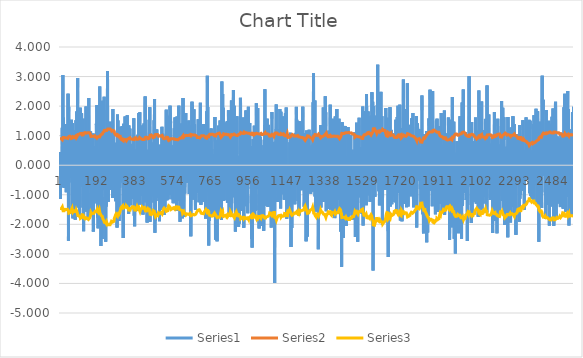
| Category | Series 0 | Series 1 | Series 2 |
|---|---|---|---|
| 0 | -0.597 | 0.893 | -1.465 |
| 1 | 0.451 | 0.897 | -1.471 |
| 2 | -1.136 | 0.885 | -1.452 |
| 3 | -0.21 | 0.897 | -1.47 |
| 4 | -0.419 | 0.896 | -1.469 |
| 5 | 0.134 | 0.898 | -1.472 |
| 6 | -0.705 | 0.895 | -1.468 |
| 7 | 0.045 | 0.893 | -1.465 |
| 8 | -0.238 | 0.889 | -1.459 |
| 9 | 0.111 | 0.889 | -1.458 |
| 10 | -0.522 | 0.889 | -1.458 |
| 11 | 1.27 | 0.861 | -1.412 |
| 12 | -0.726 | 0.874 | -1.433 |
| 13 | 1.199 | 0.858 | -1.408 |
| 14 | 3.053 | 0.871 | -1.428 |
| 15 | 0.396 | 0.938 | -1.538 |
| 16 | -0.129 | 0.933 | -1.53 |
| 17 | 1.608 | 0.933 | -1.53 |
| 18 | 0.61 | 0.951 | -1.559 |
| 19 | -0.571 | 0.953 | -1.562 |
| 20 | -0.77 | 0.948 | -1.554 |
| 21 | -0.479 | 0.937 | -1.537 |
| 22 | 0.335 | 0.94 | -1.541 |
| 23 | 0.645 | 0.933 | -1.531 |
| 24 | -0.552 | 0.919 | -1.507 |
| 25 | -0.327 | 0.909 | -1.491 |
| 26 | 1.396 | 0.91 | -1.493 |
| 27 | -0.517 | 0.924 | -1.515 |
| 28 | -0.21 | 0.926 | -1.519 |
| 29 | 0.974 | 0.919 | -1.508 |
| 30 | -0.622 | 0.92 | -1.509 |
| 31 | -0.914 | 0.914 | -1.499 |
| 32 | 1.047 | 0.915 | -1.5 |
| 33 | 0.181 | 0.922 | -1.511 |
| 34 | 0.714 | 0.916 | -1.502 |
| 35 | 0.732 | 0.919 | -1.506 |
| 36 | 0.604 | 0.909 | -1.491 |
| 37 | -0.084 | 0.909 | -1.49 |
| 38 | 0.4 | 0.907 | -1.487 |
| 39 | -0.114 | 0.907 | -1.488 |
| 40 | 2.415 | 0.907 | -1.488 |
| 41 | 0.81 | 0.911 | -1.494 |
| 42 | -2.558 | 0.91 | -1.492 |
| 43 | 1.98 | 0.964 | -1.581 |
| 44 | 0.591 | 0.989 | -1.623 |
| 45 | -0.587 | 0.991 | -1.625 |
| 46 | -0.265 | 0.992 | -1.626 |
| 47 | -0.119 | 0.991 | -1.625 |
| 48 | 0.404 | 0.989 | -1.623 |
| 49 | -0.02 | 0.985 | -1.615 |
| 50 | -0.259 | 0.979 | -1.605 |
| 51 | -0.334 | 0.975 | -1.599 |
| 52 | 0.205 | 0.967 | -1.586 |
| 53 | -0.427 | 0.966 | -1.584 |
| 54 | 0.658 | 0.954 | -1.564 |
| 55 | 0.665 | 0.955 | -1.566 |
| 56 | 0.812 | 0.923 | -1.514 |
| 57 | 1.536 | 0.908 | -1.489 |
| 58 | 0.775 | 0.915 | -1.501 |
| 59 | 0.772 | 0.916 | -1.503 |
| 60 | -1.595 | 0.886 | -1.453 |
| 61 | -0.027 | 0.913 | -1.497 |
| 62 | 1.423 | 0.913 | -1.497 |
| 63 | -1.219 | 0.925 | -1.518 |
| 64 | -1.798 | 0.933 | -1.531 |
| 65 | 0.377 | 0.964 | -1.58 |
| 66 | 0.364 | 0.956 | -1.568 |
| 67 | -0.644 | 0.952 | -1.561 |
| 68 | 0.291 | 0.956 | -1.568 |
| 69 | 0.253 | 0.943 | -1.546 |
| 70 | 0.849 | 0.942 | -1.544 |
| 71 | 0.849 | 0.942 | -1.545 |
| 72 | 0.455 | 0.945 | -1.55 |
| 73 | 0.285 | 0.939 | -1.54 |
| 74 | 0.08 | 0.939 | -1.539 |
| 75 | -1.136 | 0.937 | -1.537 |
| 76 | -1.844 | 0.952 | -1.561 |
| 77 | 0.257 | 0.981 | -1.609 |
| 78 | 1.19 | 0.972 | -1.594 |
| 79 | -0.852 | 0.973 | -1.596 |
| 80 | 1.524 | 0.974 | -1.597 |
| 81 | -1.434 | 0.921 | -1.511 |
| 82 | -0.239 | 0.941 | -1.544 |
| 83 | -1.377 | 0.942 | -1.545 |
| 84 | 1.815 | 0.942 | -1.544 |
| 85 | -0.211 | 0.963 | -1.58 |
| 86 | 1.783 | 0.96 | -1.575 |
| 87 | 1.184 | 0.976 | -1.6 |
| 88 | 2.951 | 0.981 | -1.609 |
| 89 | -0.271 | 1.039 | -1.704 |
| 90 | -0.774 | 1.039 | -1.704 |
| 91 | 0.122 | 1.042 | -1.709 |
| 92 | -1.097 | 1.04 | -1.705 |
| 93 | 1.173 | 1.041 | -1.707 |
| 94 | -0.289 | 1.045 | -1.713 |
| 95 | 0.059 | 1.045 | -1.714 |
| 96 | -0.729 | 1.041 | -1.707 |
| 97 | 1.056 | 1.042 | -1.709 |
| 98 | -1.722 | 1.039 | -1.704 |
| 99 | 0.331 | 1.06 | -1.738 |
| 100 | -1.43 | 1.06 | -1.738 |
| 101 | 1.947 | 1.076 | -1.764 |
| 102 | -0.699 | 1.096 | -1.798 |
| 103 | -0.503 | 1.1 | -1.803 |
| 104 | -0.391 | 1.102 | -1.807 |
| 105 | 0.433 | 1.103 | -1.809 |
| 106 | 1.349 | 1.104 | -1.81 |
| 107 | 1.07 | 1.077 | -1.766 |
| 108 | 1.76 | 1.08 | -1.771 |
| 109 | 0.237 | 1.047 | -1.716 |
| 110 | 0.953 | 1.022 | -1.676 |
| 111 | 0.585 | 1.025 | -1.681 |
| 112 | -0.728 | 1.022 | -1.677 |
| 113 | 0.069 | 1.027 | -1.684 |
| 114 | 0.091 | 1.027 | -1.684 |
| 115 | -0.082 | 1.026 | -1.683 |
| 116 | 1.569 | 1.026 | -1.683 |
| 117 | 1.038 | 1.039 | -1.705 |
| 118 | -2.237 | 1.043 | -1.71 |
| 119 | 0.933 | 1.085 | -1.78 |
| 120 | -1.104 | 1.087 | -1.782 |
| 121 | -0.922 | 1.097 | -1.798 |
| 122 | -0.047 | 1.103 | -1.808 |
| 123 | -1.277 | 1.1 | -1.804 |
| 124 | -1.127 | 1.099 | -1.802 |
| 125 | 0.665 | 1.105 | -1.813 |
| 126 | -0.101 | 1.104 | -1.811 |
| 127 | 0.44 | 1.085 | -1.78 |
| 128 | -1.568 | 1.086 | -1.781 |
| 129 | 0.601 | 1.092 | -1.79 |
| 130 | 1.984 | 1.082 | -1.775 |
| 131 | -1.056 | 1.082 | -1.775 |
| 132 | -0.138 | 1.091 | -1.79 |
| 133 | -0.617 | 1.091 | -1.79 |
| 134 | 0.974 | 1.091 | -1.789 |
| 135 | 0.381 | 1.096 | -1.798 |
| 136 | -0.602 | 1.097 | -1.798 |
| 137 | 0.552 | 1.096 | -1.797 |
| 138 | -0.956 | 1.093 | -1.793 |
| 139 | -0.367 | 1.1 | -1.804 |
| 140 | 0.839 | 1.101 | -1.805 |
| 141 | -1.842 | 1.105 | -1.812 |
| 142 | -0.941 | 1.12 | -1.837 |
| 143 | -0.284 | 1.102 | -1.807 |
| 144 | 2.278 | 1.102 | -1.808 |
| 145 | 0.407 | 1.127 | -1.849 |
| 146 | -0.18 | 1.122 | -1.84 |
| 147 | -0.326 | 1.108 | -1.818 |
| 148 | -0.035 | 1.094 | -1.793 |
| 149 | 0.41 | 1.093 | -1.792 |
| 150 | -0.357 | 1.078 | -1.768 |
| 151 | 0.027 | 1.058 | -1.736 |
| 152 | -0.225 | 1.058 | -1.735 |
| 153 | 1.145 | 1.037 | -1.7 |
| 154 | -0.587 | 1.036 | -1.699 |
| 155 | -0.283 | 0.973 | -1.596 |
| 156 | 0.76 | 0.973 | -1.596 |
| 157 | -1.681 | 0.973 | -1.596 |
| 158 | -0.484 | 0.995 | -1.632 |
| 159 | -0.49 | 0.988 | -1.62 |
| 160 | -0.611 | 0.979 | -1.605 |
| 161 | 0.111 | 0.981 | -1.608 |
| 162 | -1.557 | 0.981 | -1.609 |
| 163 | -1.254 | 0.995 | -1.632 |
| 164 | -0.974 | 0.997 | -1.635 |
| 165 | 0.595 | 0.982 | -1.61 |
| 166 | 1.07 | 0.984 | -1.614 |
| 167 | -2.244 | 0.978 | -1.605 |
| 168 | -1.311 | 0.985 | -1.615 |
| 169 | -0.008 | 0.993 | -1.629 |
| 170 | -0.696 | 0.992 | -1.627 |
| 171 | -1.287 | 0.994 | -1.631 |
| 172 | -1.211 | 1.003 | -1.645 |
| 173 | -0.786 | 0.995 | -1.632 |
| 174 | -0.628 | 0.986 | -1.617 |
| 175 | -0.438 | 0.957 | -1.569 |
| 176 | -1.212 | 0.956 | -1.567 |
| 177 | 0.642 | 0.951 | -1.56 |
| 178 | 0.427 | 0.952 | -1.562 |
| 179 | -0.964 | 0.954 | -1.565 |
| 180 | -0.169 | 0.957 | -1.57 |
| 181 | 0.054 | 0.956 | -1.569 |
| 182 | 1.401 | 0.957 | -1.569 |
| 183 | 1.029 | 0.952 | -1.562 |
| 184 | -0.371 | 0.952 | -1.561 |
| 185 | 2.033 | 0.92 | -1.508 |
| 186 | -1.047 | 0.951 | -1.559 |
| 187 | 0.53 | 0.95 | -1.558 |
| 188 | -0.055 | 0.95 | -1.558 |
| 189 | -1.765 | 0.95 | -1.558 |
| 190 | -0.616 | 0.961 | -1.575 |
| 191 | -2.134 | 0.955 | -1.566 |
| 192 | -0.524 | 0.978 | -1.604 |
| 193 | -0.333 | 0.979 | -1.605 |
| 194 | 0.197 | 0.975 | -1.599 |
| 195 | 0.435 | 0.962 | -1.578 |
| 196 | 0.133 | 0.96 | -1.575 |
| 197 | -0.797 | 0.921 | -1.51 |
| 198 | 0.426 | 0.918 | -1.506 |
| 199 | 2.661 | 0.922 | -1.512 |
| 200 | 0.821 | 0.988 | -1.62 |
| 201 | -0.054 | 0.985 | -1.615 |
| 202 | 1.041 | 0.982 | -1.611 |
| 203 | 0.461 | 0.993 | -1.629 |
| 204 | -0.096 | 0.992 | -1.627 |
| 205 | -2.734 | 0.987 | -1.619 |
| 206 | 0.569 | 1.036 | -1.7 |
| 207 | 2.045 | 1.033 | -1.694 |
| 208 | -0.923 | 1.049 | -1.72 |
| 209 | 0.058 | 1.049 | -1.72 |
| 210 | 1.26 | 1.049 | -1.72 |
| 211 | -2.494 | 1.02 | -1.673 |
| 212 | -1.073 | 1.057 | -1.733 |
| 213 | 0.762 | 1.062 | -1.742 |
| 214 | 2.182 | 1.069 | -1.753 |
| 215 | 1.005 | 1.108 | -1.818 |
| 216 | -0.023 | 1.116 | -1.829 |
| 217 | -0.83 | 1.115 | -1.829 |
| 218 | 1.402 | 1.118 | -1.834 |
| 219 | 0.952 | 1.135 | -1.861 |
| 220 | 0.998 | 1.132 | -1.856 |
| 221 | 2.317 | 1.139 | -1.868 |
| 222 | 1.319 | 1.178 | -1.931 |
| 223 | 0.836 | 1.186 | -1.945 |
| 224 | 0.944 | 1.174 | -1.925 |
| 225 | 1.205 | 1.179 | -1.933 |
| 226 | -0.096 | 1.186 | -1.946 |
| 227 | 0.425 | 1.184 | -1.942 |
| 228 | -0.563 | 1.185 | -1.943 |
| 229 | -2.59 | 1.171 | -1.92 |
| 230 | -0.159 | 1.205 | -1.975 |
| 231 | -1.397 | 1.198 | -1.965 |
| 232 | 0.579 | 1.209 | -1.983 |
| 233 | -0.983 | 1.204 | -1.974 |
| 234 | -0.552 | 1.177 | -1.931 |
| 235 | 0.965 | 1.168 | -1.916 |
| 236 | 1.873 | 1.174 | -1.925 |
| 237 | 0.317 | 1.191 | -1.954 |
| 238 | 3.184 | 1.18 | -1.934 |
| 239 | 0.467 | 1.227 | -2.013 |
| 240 | 1.442 | 1.222 | -2.004 |
| 241 | -0.115 | 1.227 | -2.013 |
| 242 | -1.233 | 1.225 | -2.01 |
| 243 | 0.581 | 1.226 | -2.01 |
| 244 | -0.239 | 1.225 | -2.01 |
| 245 | 1.105 | 1.226 | -2.011 |
| 246 | 1.436 | 1.222 | -2.005 |
| 247 | 0.508 | 1.23 | -2.017 |
| 248 | 1.421 | 1.23 | -2.017 |
| 249 | 0.379 | 1.23 | -2.018 |
| 250 | 0.98 | 1.227 | -2.012 |
| 251 | -0.023 | 1.227 | -2.013 |
| 252 | -0.828 | 1.208 | -1.981 |
| 253 | 1.473 | 1.205 | -1.976 |
| 254 | 0.045 | 1.214 | -1.991 |
| 255 | -0.48 | 1.213 | -1.99 |
| 256 | -0.483 | 1.19 | -1.952 |
| 257 | 1.377 | 1.189 | -1.95 |
| 258 | 1.028 | 1.157 | -1.897 |
| 259 | -0.828 | 1.154 | -1.893 |
| 260 | -0.353 | 1.161 | -1.903 |
| 261 | -0.267 | 1.164 | -1.909 |
| 262 | -0.096 | 1.166 | -1.913 |
| 263 | -1.109 | 1.167 | -1.914 |
| 264 | -0.554 | 1.173 | -1.923 |
| 265 | 1.903 | 1.178 | -1.931 |
| 266 | 0.697 | 1.158 | -1.899 |
| 267 | -0.135 | 1.157 | -1.898 |
| 268 | 0.239 | 1.158 | -1.899 |
| 269 | 1.159 | 1.154 | -1.893 |
| 270 | -0.053 | 1.159 | -1.9 |
| 271 | -0.529 | 1.159 | -1.9 |
| 272 | -0.928 | 1.1 | -1.804 |
| 273 | -0.229 | 1.11 | -1.821 |
| 274 | 0.148 | 1.091 | -1.789 |
| 275 | -1.08 | 1.081 | -1.773 |
| 276 | 0.533 | 1.094 | -1.794 |
| 277 | 0.209 | 1.087 | -1.783 |
| 278 | 0.05 | 1.031 | -1.691 |
| 279 | -1.22 | 1.017 | -1.668 |
| 280 | 0.472 | 1.033 | -1.694 |
| 281 | 0.763 | 1.006 | -1.65 |
| 282 | 0.034 | 1.004 | -1.647 |
| 283 | -0.666 | 1.004 | -1.646 |
| 284 | -1.138 | 1.001 | -1.642 |
| 285 | -0.571 | 1.006 | -1.65 |
| 286 | -2.11 | 1.007 | -1.651 |
| 287 | -0.48 | 1.041 | -1.708 |
| 288 | 1.716 | 1.009 | -1.655 |
| 289 | -0.065 | 1.017 | -1.668 |
| 290 | 1.516 | 1.014 | -1.662 |
| 291 | -0.362 | 1.023 | -1.678 |
| 292 | -0.235 | 1.016 | -1.666 |
| 293 | -0.363 | 1.016 | -1.667 |
| 294 | 0.826 | 1.017 | -1.668 |
| 295 | 0.535 | 1.018 | -1.669 |
| 296 | -1.889 | 0.962 | -1.577 |
| 297 | 0.321 | 0.993 | -1.629 |
| 298 | 0.355 | 0.975 | -1.599 |
| 299 | -0.766 | 0.974 | -1.598 |
| 300 | -0.761 | 0.971 | -1.592 |
| 301 | 0.89 | 0.973 | -1.596 |
| 302 | -0.579 | 0.972 | -1.595 |
| 303 | 0.084 | 0.952 | -1.561 |
| 304 | 1.3 | 0.952 | -1.561 |
| 305 | -0.255 | 0.884 | -1.45 |
| 306 | 0.682 | 0.884 | -1.449 |
| 307 | 0.068 | 0.87 | -1.427 |
| 308 | -0.509 | 0.87 | -1.427 |
| 309 | 0.034 | 0.858 | -1.407 |
| 310 | -0.236 | 0.855 | -1.403 |
| 311 | -0.584 | 0.855 | -1.403 |
| 312 | 1.323 | 0.849 | -1.392 |
| 313 | 0.714 | 0.846 | -1.388 |
| 314 | -0.475 | 0.848 | -1.391 |
| 315 | 0.531 | 0.833 | -1.366 |
| 316 | 0.514 | 0.834 | -1.368 |
| 317 | -2.463 | 0.828 | -1.357 |
| 318 | -0.816 | 0.882 | -1.446 |
| 319 | 1.402 | 0.882 | -1.446 |
| 320 | 0.449 | 0.88 | -1.443 |
| 321 | 0.14 | 0.882 | -1.446 |
| 322 | -0.707 | 0.88 | -1.443 |
| 323 | 0.068 | 0.882 | -1.447 |
| 324 | -0.059 | 0.865 | -1.418 |
| 325 | 0.494 | 0.855 | -1.401 |
| 326 | 1.646 | 0.852 | -1.397 |
| 327 | 0.441 | 0.876 | -1.436 |
| 328 | 0.464 | 0.877 | -1.438 |
| 329 | 0.118 | 0.878 | -1.44 |
| 330 | 0.032 | 0.867 | -1.422 |
| 331 | -0.381 | 0.864 | -1.417 |
| 332 | 0.371 | 0.833 | -1.367 |
| 333 | -1.379 | 0.83 | -1.362 |
| 334 | -0.591 | 0.847 | -1.39 |
| 335 | 0.87 | 0.85 | -1.393 |
| 336 | 1.227 | 0.844 | -1.384 |
| 337 | 1.688 | 0.858 | -1.408 |
| 338 | 1.072 | 0.881 | -1.445 |
| 339 | -1.036 | 0.882 | -1.447 |
| 340 | 0.571 | 0.892 | -1.463 |
| 341 | -0.887 | 0.894 | -1.466 |
| 342 | -1.06 | 0.891 | -1.461 |
| 343 | 0.709 | 0.899 | -1.474 |
| 344 | -1.643 | 0.903 | -1.48 |
| 345 | 1.345 | 0.926 | -1.518 |
| 346 | 0.541 | 0.927 | -1.521 |
| 347 | -0.889 | 0.928 | -1.522 |
| 348 | 0.364 | 0.931 | -1.526 |
| 349 | 0.201 | 0.931 | -1.528 |
| 350 | 1.239 | 0.928 | -1.521 |
| 351 | -0.626 | 0.928 | -1.521 |
| 352 | 0.596 | 0.928 | -1.522 |
| 353 | -0.463 | 0.889 | -1.459 |
| 354 | -1.357 | 0.889 | -1.458 |
| 355 | -1.375 | 0.884 | -1.45 |
| 356 | -0.174 | 0.902 | -1.479 |
| 357 | -0.697 | 0.883 | -1.449 |
| 358 | -0.088 | 0.886 | -1.454 |
| 359 | -0.393 | 0.886 | -1.453 |
| 360 | 0.261 | 0.886 | -1.453 |
| 361 | 0.72 | 0.881 | -1.445 |
| 362 | -0.799 | 0.883 | -1.448 |
| 363 | -0.677 | 0.857 | -1.405 |
| 364 | -1.145 | 0.86 | -1.411 |
| 365 | 0.443 | 0.871 | -1.428 |
| 366 | 0.066 | 0.867 | -1.422 |
| 367 | 0.726 | 0.862 | -1.414 |
| 368 | -0.301 | 0.86 | -1.41 |
| 369 | 0.464 | 0.857 | -1.406 |
| 370 | 1.59 | 0.859 | -1.409 |
| 371 | -0.673 | 0.866 | -1.421 |
| 372 | -1.707 | 0.87 | -1.427 |
| 373 | -0.136 | 0.892 | -1.463 |
| 374 | -2.062 | 0.892 | -1.463 |
| 375 | -0.554 | 0.925 | -1.517 |
| 376 | -1.542 | 0.927 | -1.52 |
| 377 | 0.469 | 0.945 | -1.55 |
| 378 | -0.231 | 0.945 | -1.55 |
| 379 | -0.373 | 0.93 | -1.524 |
| 380 | -0.644 | 0.925 | -1.517 |
| 381 | -0.296 | 0.926 | -1.519 |
| 382 | 0.533 | 0.923 | -1.514 |
| 383 | -0.192 | 0.924 | -1.515 |
| 384 | -0.517 | 0.875 | -1.436 |
| 385 | 0.06 | 0.872 | -1.43 |
| 386 | 0.843 | 0.853 | -1.399 |
| 387 | -1.535 | 0.858 | -1.407 |
| 388 | -0.374 | 0.876 | -1.437 |
| 389 | 0.437 | 0.873 | -1.432 |
| 390 | -0.145 | 0.876 | -1.436 |
| 391 | 1.031 | 0.876 | -1.436 |
| 392 | -0.297 | 0.884 | -1.449 |
| 393 | -1.046 | 0.857 | -1.406 |
| 394 | 0.567 | 0.862 | -1.413 |
| 395 | 1.768 | 0.863 | -1.415 |
| 396 | 0.662 | 0.894 | -1.466 |
| 397 | 1.703 | 0.899 | -1.474 |
| 398 | -1.331 | 0.925 | -1.517 |
| 399 | 0.978 | 0.936 | -1.535 |
| 400 | 1.789 | 0.931 | -1.528 |
| 401 | -0.49 | 0.956 | -1.569 |
| 402 | -0.179 | 0.951 | -1.56 |
| 403 | 0.567 | 0.938 | -1.539 |
| 404 | -0.173 | 0.916 | -1.502 |
| 405 | -0.082 | 0.904 | -1.483 |
| 406 | 1.32 | 0.897 | -1.471 |
| 407 | 0.426 | 0.91 | -1.492 |
| 408 | -0.507 | 0.906 | -1.486 |
| 409 | -0.148 | 0.899 | -1.475 |
| 410 | -0.656 | 0.894 | -1.467 |
| 411 | 0.21 | 0.876 | -1.436 |
| 412 | -0.163 | 0.859 | -1.409 |
| 413 | -0.841 | 0.856 | -1.403 |
| 414 | -1.041 | 0.855 | -1.402 |
| 415 | 0.286 | 0.861 | -1.413 |
| 416 | -1.669 | 0.862 | -1.413 |
| 417 | 1.359 | 0.867 | -1.422 |
| 418 | -0.469 | 0.884 | -1.45 |
| 419 | -0.063 | 0.881 | -1.444 |
| 420 | 0.12 | 0.88 | -1.443 |
| 421 | 1.408 | 0.866 | -1.421 |
| 422 | 0.537 | 0.871 | -1.428 |
| 423 | -0.359 | 0.874 | -1.433 |
| 424 | 1.243 | 0.871 | -1.428 |
| 425 | 0.666 | 0.885 | -1.451 |
| 426 | -1.251 | 0.888 | -1.456 |
| 427 | 2.328 | 0.9 | -1.476 |
| 428 | -0.136 | 0.942 | -1.544 |
| 429 | 1.095 | 0.936 | -1.536 |
| 430 | -0.612 | 0.942 | -1.545 |
| 431 | -0.636 | 0.934 | -1.531 |
| 432 | -0.489 | 0.936 | -1.535 |
| 433 | -1.103 | 0.938 | -1.539 |
| 434 | 0.485 | 0.944 | -1.548 |
| 435 | -0.176 | 0.945 | -1.55 |
| 436 | -0.072 | 0.944 | -1.548 |
| 437 | -1.94 | 0.922 | -1.513 |
| 438 | 0.482 | 0.949 | -1.556 |
| 439 | 0.523 | 0.928 | -1.522 |
| 440 | -0.436 | 0.93 | -1.526 |
| 441 | -0.478 | 0.896 | -1.469 |
| 442 | -0.544 | 0.895 | -1.468 |
| 443 | -0.84 | 0.877 | -1.438 |
| 444 | -1.205 | 0.882 | -1.446 |
| 445 | -1.113 | 0.894 | -1.466 |
| 446 | 0.882 | 0.903 | -1.481 |
| 447 | 1.542 | 0.906 | -1.486 |
| 448 | -0.723 | 0.925 | -1.517 |
| 449 | -1.879 | 0.927 | -1.521 |
| 450 | 1.96 | 0.956 | -1.568 |
| 451 | -1.916 | 0.984 | -1.614 |
| 452 | 0.438 | 1.013 | -1.661 |
| 453 | 1.067 | 1.009 | -1.654 |
| 454 | 1.007 | 0.999 | -1.638 |
| 455 | -1.484 | 1.005 | -1.647 |
| 456 | 0.675 | 1.021 | -1.674 |
| 457 | 0.777 | 1.024 | -1.679 |
| 458 | -1.057 | 1.021 | -1.674 |
| 459 | -0.28 | 1.029 | -1.687 |
| 460 | 0.194 | 1.021 | -1.674 |
| 461 | 0.734 | 1.019 | -1.671 |
| 462 | -0.627 | 0.999 | -1.639 |
| 463 | 0.713 | 0.999 | -1.638 |
| 464 | 0.424 | 0.98 | -1.608 |
| 465 | -0.374 | 0.968 | -1.587 |
| 466 | 0.222 | 0.961 | -1.577 |
| 467 | 0.051 | 0.935 | -1.533 |
| 468 | -0.524 | 0.933 | -1.531 |
| 469 | 0.213 | 0.935 | -1.534 |
| 470 | 0.526 | 0.933 | -1.53 |
| 471 | -1.259 | 0.935 | -1.534 |
| 472 | 1.519 | 0.947 | -1.554 |
| 473 | 0.561 | 0.952 | -1.561 |
| 474 | 2.241 | 0.953 | -1.563 |
| 475 | -0.775 | 0.992 | -1.627 |
| 476 | -2.284 | 0.996 | -1.634 |
| 477 | -0.716 | 1.032 | -1.693 |
| 478 | -1.879 | 1.035 | -1.697 |
| 479 | 0.457 | 1.059 | -1.737 |
| 480 | 0.397 | 1.057 | -1.733 |
| 481 | 0.347 | 1.051 | -1.723 |
| 482 | -1.206 | 1.051 | -1.724 |
| 483 | 0.252 | 1.042 | -1.708 |
| 484 | 0.046 | 1.028 | -1.686 |
| 485 | 1.209 | 1.026 | -1.683 |
| 486 | 0.962 | 1.038 | -1.702 |
| 487 | -0.975 | 1.045 | -1.713 |
| 488 | 0.996 | 1.036 | -1.699 |
| 489 | -0.035 | 1.042 | -1.708 |
| 490 | -0.415 | 1.041 | -1.707 |
| 491 | -0.395 | 1.03 | -1.689 |
| 492 | -1.101 | 1.027 | -1.684 |
| 493 | -0.34 | 1.024 | -1.68 |
| 494 | -0.986 | 0.98 | -1.607 |
| 495 | -1.105 | 0.986 | -1.617 |
| 496 | 0.167 | 0.981 | -1.609 |
| 497 | 0.307 | 0.98 | -1.608 |
| 498 | -0.277 | 0.98 | -1.607 |
| 499 | -1.895 | 0.979 | -1.606 |
| 500 | 0.694 | 0.996 | -1.633 |
| 501 | -1.154 | 0.998 | -1.637 |
| 502 | -0.578 | 1.006 | -1.65 |
| 503 | 0.673 | 1.008 | -1.652 |
| 504 | -0.162 | 0.987 | -1.619 |
| 505 | -0.324 | 0.985 | -1.615 |
| 506 | -0.143 | 0.982 | -1.61 |
| 507 | 0.473 | 0.981 | -1.609 |
| 508 | -1.497 | 0.983 | -1.612 |
| 509 | -1.205 | 0.996 | -1.633 |
| 510 | -1.237 | 1.001 | -1.642 |
| 511 | 1.298 | 1.001 | -1.642 |
| 512 | 0.516 | 1.009 | -1.655 |
| 513 | 0.212 | 1.005 | -1.648 |
| 514 | -0.236 | 0.984 | -1.614 |
| 515 | 1.064 | 0.982 | -1.61 |
| 516 | 0.443 | 0.967 | -1.586 |
| 517 | -0.054 | 0.936 | -1.535 |
| 518 | -0.044 | 0.908 | -1.489 |
| 519 | -0.708 | 0.906 | -1.485 |
| 520 | -1.442 | 0.897 | -1.472 |
| 521 | 0.031 | 0.901 | -1.478 |
| 522 | -0.471 | 0.886 | -1.453 |
| 523 | -1.672 | 0.881 | -1.445 |
| 524 | -0.508 | 0.893 | -1.465 |
| 525 | 0.708 | 0.888 | -1.456 |
| 526 | -1.431 | 0.894 | -1.466 |
| 527 | 0.598 | 0.907 | -1.487 |
| 528 | 0.908 | 0.905 | -1.484 |
| 529 | 0.631 | 0.913 | -1.497 |
| 530 | 0.886 | 0.912 | -1.495 |
| 531 | 0.111 | 0.918 | -1.505 |
| 532 | -0.204 | 0.918 | -1.505 |
| 533 | 1.877 | 0.917 | -1.504 |
| 534 | -0.959 | 0.95 | -1.558 |
| 535 | -0.022 | 0.954 | -1.565 |
| 536 | -1.182 | 0.953 | -1.564 |
| 537 | -0.103 | 0.958 | -1.572 |
| 538 | 1.285 | 0.948 | -1.556 |
| 539 | 0.205 | 0.943 | -1.546 |
| 540 | -0.023 | 0.94 | -1.541 |
| 541 | 0.213 | 0.891 | -1.461 |
| 542 | -1.155 | 0.889 | -1.458 |
| 543 | 0.394 | 0.858 | -1.407 |
| 544 | 0.748 | 0.858 | -1.407 |
| 545 | 0.166 | 0.836 | -1.371 |
| 546 | 0.904 | 0.834 | -1.368 |
| 547 | 0.159 | 0.841 | -1.379 |
| 548 | -0.069 | 0.84 | -1.377 |
| 549 | 0.634 | 0.828 | -1.358 |
| 550 | 1.673 | 0.832 | -1.364 |
| 551 | -1.008 | 0.859 | -1.409 |
| 552 | 2.011 | 0.852 | -1.398 |
| 553 | 0.708 | 0.881 | -1.446 |
| 554 | 1.749 | 0.879 | -1.442 |
| 555 | 1.419 | 0.897 | -1.472 |
| 556 | 0.495 | 0.915 | -1.5 |
| 557 | -0.434 | 0.915 | -1.501 |
| 558 | -0.238 | 0.916 | -1.502 |
| 559 | 0.674 | 0.906 | -1.485 |
| 560 | -0.187 | 0.908 | -1.489 |
| 561 | -1.155 | 0.899 | -1.475 |
| 562 | -0.085 | 0.9 | -1.477 |
| 563 | -0.128 | 0.9 | -1.477 |
| 564 | -1.138 | 0.9 | -1.476 |
| 565 | -1.082 | 0.911 | -1.494 |
| 566 | -0.635 | 0.89 | -1.459 |
| 567 | 0.573 | 0.89 | -1.459 |
| 568 | -1.283 | 0.88 | -1.443 |
| 569 | -0.136 | 0.892 | -1.463 |
| 570 | -0.722 | 0.889 | -1.457 |
| 571 | 0.289 | 0.893 | -1.465 |
| 572 | 0.362 | 0.893 | -1.464 |
| 573 | 1.247 | 0.893 | -1.465 |
| 574 | 0.251 | 0.904 | -1.483 |
| 575 | 0.601 | 0.884 | -1.45 |
| 576 | -0.702 | 0.872 | -1.43 |
| 577 | 1.612 | 0.862 | -1.413 |
| 578 | 0.056 | 0.869 | -1.425 |
| 579 | 0.067 | 0.868 | -1.423 |
| 580 | -0.291 | 0.868 | -1.423 |
| 581 | -0.197 | 0.868 | -1.423 |
| 582 | 0.14 | 0.86 | -1.411 |
| 583 | 0.605 | 0.859 | -1.409 |
| 584 | -0.869 | 0.861 | -1.413 |
| 585 | -1.548 | 0.869 | -1.425 |
| 586 | -0.524 | 0.887 | -1.454 |
| 587 | 1.652 | 0.87 | -1.427 |
| 588 | -0.182 | 0.891 | -1.462 |
| 589 | 0.221 | 0.889 | -1.458 |
| 590 | -0.297 | 0.861 | -1.412 |
| 591 | 0.965 | 0.859 | -1.409 |
| 592 | -0.749 | 0.862 | -1.414 |
| 593 | -1.199 | 0.847 | -1.389 |
| 594 | 1.028 | 0.861 | -1.413 |
| 595 | 0.854 | 0.863 | -1.415 |
| 596 | 2.015 | 0.866 | -1.42 |
| 597 | -0.79 | 0.892 | -1.462 |
| 598 | -1.192 | 0.899 | -1.474 |
| 599 | 1.406 | 0.913 | -1.497 |
| 600 | 0.939 | 0.9 | -1.477 |
| 601 | -0.89 | 0.896 | -1.47 |
| 602 | -1.912 | 0.905 | -1.484 |
| 603 | -0.146 | 0.925 | -1.518 |
| 604 | -0.952 | 0.925 | -1.518 |
| 605 | -0.305 | 0.923 | -1.513 |
| 606 | 0.881 | 0.924 | -1.515 |
| 607 | 0.151 | 0.929 | -1.524 |
| 608 | -0.816 | 0.929 | -1.524 |
| 609 | -0.632 | 0.923 | -1.514 |
| 610 | -1.005 | 0.926 | -1.519 |
| 611 | 0.529 | 0.932 | -1.528 |
| 612 | -1.725 | 0.934 | -1.531 |
| 613 | 1.411 | 0.953 | -1.562 |
| 614 | -1.794 | 0.968 | -1.587 |
| 615 | 0.968 | 0.994 | -1.629 |
| 616 | -0.061 | 0.998 | -1.636 |
| 617 | 2.277 | 0.976 | -1.6 |
| 618 | 0.82 | 1.008 | -1.653 |
| 619 | -0.792 | 0.982 | -1.611 |
| 620 | -0.25 | 0.983 | -1.612 |
| 621 | -1.749 | 0.959 | -1.572 |
| 622 | 1.7 | 0.964 | -1.581 |
| 623 | -0.404 | 0.986 | -1.617 |
| 624 | 1.044 | 0.986 | -1.617 |
| 625 | 0.855 | 0.995 | -1.632 |
| 626 | -0.961 | 0.997 | -1.636 |
| 627 | -0.285 | 1.004 | -1.646 |
| 628 | 0.78 | 0.995 | -1.631 |
| 629 | 0.351 | 1 | -1.64 |
| 630 | 1.725 | 1.001 | -1.641 |
| 631 | 1.768 | 1.014 | -1.663 |
| 632 | 0.24 | 1.027 | -1.684 |
| 633 | 0.528 | 1.023 | -1.678 |
| 634 | -0.117 | 1.023 | -1.678 |
| 635 | 0.214 | 1.009 | -1.655 |
| 636 | 0.433 | 1.009 | -1.654 |
| 637 | 1.346 | 1.004 | -1.647 |
| 638 | -0.602 | 1.016 | -1.665 |
| 639 | -0.062 | 1.019 | -1.671 |
| 640 | -0.036 | 1.009 | -1.656 |
| 641 | 0.554 | 1.009 | -1.655 |
| 642 | 0.809 | 1.009 | -1.655 |
| 643 | 0.558 | 1.008 | -1.653 |
| 644 | -0.186 | 0.992 | -1.627 |
| 645 | 0.138 | 0.993 | -1.628 |
| 646 | 1.514 | 0.993 | -1.628 |
| 647 | 0.867 | 1.007 | -1.651 |
| 648 | -0.972 | 1.01 | -1.656 |
| 649 | 1.34 | 1.019 | -1.671 |
| 650 | 0.292 | 1.028 | -1.687 |
| 651 | 0.256 | 1.021 | -1.674 |
| 652 | -0.495 | 0.999 | -1.638 |
| 653 | -0.895 | 0.998 | -1.637 |
| 654 | -0.637 | 0.99 | -1.623 |
| 655 | -0.157 | 0.994 | -1.629 |
| 656 | -2.402 | 0.994 | -1.63 |
| 657 | -0.726 | 1.041 | -1.707 |
| 658 | -0.36 | 1.04 | -1.705 |
| 659 | 0.59 | 1.036 | -1.699 |
| 660 | -0.545 | 1.026 | -1.682 |
| 661 | -0.944 | 1.022 | -1.676 |
| 662 | 2.15 | 1.025 | -1.681 |
| 663 | -0.392 | 1.029 | -1.688 |
| 664 | 2.021 | 1.025 | -1.682 |
| 665 | 1.46 | 1.041 | -1.707 |
| 666 | -0.639 | 1.042 | -1.709 |
| 667 | 0.392 | 1.041 | -1.707 |
| 668 | -1.158 | 1.034 | -1.696 |
| 669 | 0.258 | 1.016 | -1.666 |
| 670 | -0.262 | 1.015 | -1.665 |
| 671 | 1.101 | 1.008 | -1.652 |
| 672 | 1.889 | 1.013 | -1.661 |
| 673 | -0.021 | 1.032 | -1.692 |
| 674 | -0.095 | 1.032 | -1.692 |
| 675 | 1.378 | 1.025 | -1.681 |
| 676 | -0.611 | 1.03 | -1.69 |
| 677 | 0.557 | 1.024 | -1.68 |
| 678 | -1.05 | 1.025 | -1.68 |
| 679 | -1.508 | 1.008 | -1.653 |
| 680 | -1.388 | 1.019 | -1.672 |
| 681 | -0.345 | 1.008 | -1.654 |
| 682 | -0.296 | 1.006 | -1.649 |
| 683 | -0.931 | 1.007 | -1.651 |
| 684 | 0.131 | 0.98 | -1.608 |
| 685 | -0.918 | 0.977 | -1.601 |
| 686 | 0.716 | 0.978 | -1.605 |
| 687 | -0.212 | 0.98 | -1.608 |
| 688 | 0.967 | 0.953 | -1.563 |
| 689 | -0.922 | 0.939 | -1.54 |
| 690 | -0.21 | 0.946 | -1.551 |
| 691 | 0.06 | 0.939 | -1.54 |
| 692 | 0.125 | 0.935 | -1.533 |
| 693 | 1.554 | 0.925 | -1.518 |
| 694 | 0.313 | 0.941 | -1.543 |
| 695 | -0.128 | 0.938 | -1.538 |
| 696 | -0.314 | 0.938 | -1.538 |
| 697 | -1.253 | 0.918 | -1.505 |
| 698 | 1.224 | 0.908 | -1.489 |
| 699 | 0.318 | 0.919 | -1.507 |
| 700 | 0.952 | 0.918 | -1.505 |
| 701 | 0.748 | 0.924 | -1.516 |
| 702 | -0.594 | 0.928 | -1.522 |
| 703 | 1.348 | 0.93 | -1.526 |
| 704 | 2.113 | 0.93 | -1.526 |
| 705 | -1.011 | 0.96 | -1.574 |
| 706 | 0.992 | 0.97 | -1.59 |
| 707 | -1.337 | 0.976 | -1.6 |
| 708 | 1.12 | 0.99 | -1.624 |
| 709 | -0.425 | 0.994 | -1.631 |
| 710 | -0.49 | 0.995 | -1.631 |
| 711 | 1.169 | 0.996 | -1.634 |
| 712 | 1.34 | 1.006 | -1.649 |
| 713 | -0.038 | 1.002 | -1.643 |
| 714 | -0.901 | 0.997 | -1.635 |
| 715 | -0.189 | 0.996 | -1.634 |
| 716 | -0.261 | 0.984 | -1.613 |
| 717 | -1.236 | 0.984 | -1.614 |
| 718 | -0.498 | 0.996 | -1.633 |
| 719 | -1.222 | 0.996 | -1.633 |
| 720 | 0.187 | 1.001 | -1.642 |
| 721 | 1.396 | 0.998 | -1.637 |
| 722 | -0.747 | 1.012 | -1.66 |
| 723 | 1.088 | 0.97 | -1.591 |
| 724 | -0.06 | 0.973 | -1.596 |
| 725 | 0.141 | 0.972 | -1.594 |
| 726 | 0.213 | 0.97 | -1.591 |
| 727 | 0.262 | 0.967 | -1.585 |
| 728 | -0.98 | 0.958 | -1.571 |
| 729 | 0.077 | 0.933 | -1.53 |
| 730 | -1.805 | 0.931 | -1.527 |
| 731 | -0.187 | 0.928 | -1.522 |
| 732 | -0.391 | 0.911 | -1.493 |
| 733 | 1.074 | 0.908 | -1.49 |
| 734 | -0.903 | 0.917 | -1.504 |
| 735 | -0.516 | 0.912 | -1.496 |
| 736 | 1.825 | 0.914 | -1.499 |
| 737 | -0.231 | 0.94 | -1.542 |
| 738 | 0.328 | 0.932 | -1.528 |
| 739 | 3.024 | 0.903 | -1.48 |
| 740 | 0.837 | 0.977 | -1.602 |
| 741 | 1.973 | 0.981 | -1.61 |
| 742 | 0.832 | 0.996 | -1.634 |
| 743 | 0.329 | 0.997 | -1.636 |
| 744 | 0.005 | 0.996 | -1.633 |
| 745 | -0.281 | 0.986 | -1.617 |
| 746 | -2.716 | 0.967 | -1.585 |
| 747 | 0.624 | 1.011 | -1.658 |
| 748 | -0.165 | 1.012 | -1.659 |
| 749 | -1.883 | 1.011 | -1.658 |
| 750 | -1.358 | 1.033 | -1.694 |
| 751 | -0.035 | 1.048 | -1.719 |
| 752 | -0.731 | 1.041 | -1.707 |
| 753 | -0.791 | 1.043 | -1.71 |
| 754 | 0.449 | 1.047 | -1.718 |
| 755 | -0.549 | 1.042 | -1.71 |
| 756 | 0.828 | 1.038 | -1.703 |
| 757 | -0.037 | 1.042 | -1.709 |
| 758 | 1.24 | 1.042 | -1.709 |
| 759 | -1.173 | 1.052 | -1.725 |
| 760 | -0.531 | 1.047 | -1.717 |
| 761 | 0.546 | 1.049 | -1.72 |
| 762 | -0.399 | 1.05 | -1.723 |
| 763 | -0.631 | 1.051 | -1.723 |
| 764 | -1.678 | 1.042 | -1.709 |
| 765 | -0.557 | 1.053 | -1.726 |
| 766 | -0.336 | 1.054 | -1.729 |
| 767 | 0.018 | 1.048 | -1.719 |
| 768 | -0.317 | 1.044 | -1.712 |
| 769 | -1.577 | 1.042 | -1.709 |
| 770 | 0.377 | 1.044 | -1.713 |
| 771 | -1.098 | 1.01 | -1.656 |
| 772 | -1.138 | 1.011 | -1.658 |
| 773 | -0.329 | 1.009 | -1.655 |
| 774 | -0.186 | 0.999 | -1.638 |
| 775 | -0.03 | 0.986 | -1.618 |
| 776 | -0.358 | 0.986 | -1.617 |
| 777 | 1.63 | 0.985 | -1.616 |
| 778 | 0.799 | 0.996 | -1.634 |
| 779 | -0.834 | 0.986 | -1.617 |
| 780 | -2.517 | 0.99 | -1.623 |
| 781 | -1.651 | 1.028 | -1.686 |
| 782 | -0.601 | 1.044 | -1.712 |
| 783 | -1.457 | 1.045 | -1.714 |
| 784 | 0.59 | 1.049 | -1.72 |
| 785 | -1.27 | 1.053 | -1.726 |
| 786 | 0.418 | 1.053 | -1.728 |
| 787 | 0.652 | 1.055 | -1.73 |
| 788 | -2.575 | 1.042 | -1.709 |
| 789 | 0.839 | 1.08 | -1.772 |
| 790 | -0.164 | 1.076 | -1.765 |
| 791 | -0.189 | 1.076 | -1.765 |
| 792 | 0.052 | 1.075 | -1.763 |
| 793 | -0.107 | 1.074 | -1.762 |
| 794 | -0.176 | 1.072 | -1.759 |
| 795 | 1.336 | 1.069 | -1.752 |
| 796 | -0.775 | 1.085 | -1.78 |
| 797 | -0.488 | 1.069 | -1.753 |
| 798 | -1.708 | 1.07 | -1.754 |
| 799 | 0.214 | 1.086 | -1.78 |
| 800 | -0.606 | 1.075 | -1.763 |
| 801 | -0.328 | 1.073 | -1.759 |
| 802 | 0.201 | 1.072 | -1.758 |
| 803 | 1.51 | 1.043 | -1.71 |
| 804 | -1.186 | 1.065 | -1.746 |
| 805 | 0.187 | 1.069 | -1.753 |
| 806 | 0.848 | 0.99 | -1.623 |
| 807 | -0.321 | 0.99 | -1.624 |
| 808 | -0.478 | 0.949 | -1.556 |
| 809 | -0.134 | 0.938 | -1.538 |
| 810 | -1.852 | 0.934 | -1.533 |
| 811 | 0.159 | 0.951 | -1.56 |
| 812 | 2.832 | 0.954 | -1.564 |
| 813 | 0.123 | 0.988 | -1.62 |
| 814 | -0.78 | 0.983 | -1.611 |
| 815 | -0.345 | 0.984 | -1.614 |
| 816 | 2.412 | 0.964 | -1.581 |
| 817 | -0.275 | 1.01 | -1.656 |
| 818 | 1.342 | 1.01 | -1.656 |
| 819 | 1.942 | 1.026 | -1.683 |
| 820 | -1.213 | 1.056 | -1.732 |
| 821 | -0.679 | 1.061 | -1.741 |
| 822 | -0.292 | 1.062 | -1.742 |
| 823 | 0.062 | 1.055 | -1.73 |
| 824 | -1.185 | 1.055 | -1.73 |
| 825 | 0.557 | 1.047 | -1.716 |
| 826 | 0.344 | 1.044 | -1.713 |
| 827 | -0.528 | 1.046 | -1.715 |
| 828 | -0.62 | 1.042 | -1.709 |
| 829 | 0.303 | 1.043 | -1.711 |
| 830 | -0.858 | 1.044 | -1.712 |
| 831 | -0.776 | 1.031 | -1.691 |
| 832 | 1.443 | 1.032 | -1.693 |
| 833 | -0.575 | 1.052 | -1.725 |
| 834 | 0.727 | 1.053 | -1.726 |
| 835 | 0.346 | 1.058 | -1.735 |
| 836 | 0.299 | 1.045 | -1.714 |
| 837 | -0.661 | 1.044 | -1.713 |
| 838 | -0.145 | 1.039 | -1.705 |
| 839 | 1.5 | 1.032 | -1.692 |
| 840 | -1.266 | 1.05 | -1.722 |
| 841 | -0.566 | 1.06 | -1.739 |
| 842 | 0.564 | 1.062 | -1.741 |
| 843 | -0.511 | 1.064 | -1.745 |
| 844 | -0.297 | 1.043 | -1.711 |
| 845 | 1.858 | 1.037 | -1.701 |
| 846 | 0.462 | 1.062 | -1.742 |
| 847 | -0.732 | 1.02 | -1.673 |
| 848 | 0.437 | 1.004 | -1.647 |
| 849 | -1.72 | 1.003 | -1.646 |
| 850 | 0.054 | 1.01 | -1.656 |
| 851 | -1.171 | 1.007 | -1.651 |
| 852 | -0.941 | 1.005 | -1.648 |
| 853 | -0.1 | 1.01 | -1.656 |
| 854 | 0.31 | 1.006 | -1.649 |
| 855 | -0.539 | 0.956 | -1.569 |
| 856 | -1.74 | 0.952 | -1.562 |
| 857 | -0.852 | 0.975 | -1.599 |
| 858 | -1.614 | 0.98 | -1.607 |
| 859 | -0.405 | 0.998 | -1.636 |
| 860 | 2.189 | 0.998 | -1.637 |
| 861 | -1.288 | 1.037 | -1.701 |
| 862 | 0.81 | 1.033 | -1.694 |
| 863 | 0.406 | 1.036 | -1.698 |
| 864 | 0.931 | 1.036 | -1.699 |
| 865 | -1.063 | 1.023 | -1.678 |
| 866 | 0.159 | 1.03 | -1.69 |
| 867 | -0.346 | 1.028 | -1.686 |
| 868 | 0.785 | 1.028 | -1.686 |
| 869 | -0.841 | 1.033 | -1.694 |
| 870 | 2.542 | 1.019 | -1.672 |
| 871 | -0.47 | 1.059 | -1.737 |
| 872 | -0.034 | 1.06 | -1.739 |
| 873 | 0.505 | 1.055 | -1.73 |
| 874 | 2.013 | 1.056 | -1.732 |
| 875 | 0.157 | 1.084 | -1.777 |
| 876 | 1.447 | 1.084 | -1.777 |
| 877 | 0.7 | 1.072 | -1.758 |
| 878 | -1.093 | 1.075 | -1.763 |
| 879 | 0.133 | 1.028 | -1.685 |
| 880 | -2.241 | 1.028 | -1.685 |
| 881 | -0.34 | 1.06 | -1.739 |
| 882 | -0.755 | 1.06 | -1.739 |
| 883 | -0.472 | 1.02 | -1.673 |
| 884 | -0.497 | 1.021 | -1.675 |
| 885 | -0.61 | 1.007 | -1.652 |
| 886 | -1.683 | 0.977 | -1.602 |
| 887 | -0.05 | 0.987 | -1.618 |
| 888 | 1.658 | 0.984 | -1.614 |
| 889 | 0.365 | 1.008 | -1.653 |
| 890 | -1.018 | 1.01 | -1.656 |
| 891 | -0.599 | 1.007 | -1.651 |
| 892 | -0.778 | 1.006 | -1.649 |
| 893 | -1.211 | 1.008 | -1.652 |
| 894 | 0.169 | 1.015 | -1.665 |
| 895 | -1.392 | 1.014 | -1.663 |
| 896 | -2.085 | 1.025 | -1.681 |
| 897 | -0.634 | 1.049 | -1.72 |
| 898 | -1.225 | 1.048 | -1.718 |
| 899 | -1.982 | 1.036 | -1.7 |
| 900 | -0.182 | 1.059 | -1.736 |
| 901 | 0.323 | 1.052 | -1.725 |
| 902 | -0.771 | 1.052 | -1.725 |
| 903 | -0.355 | 1.052 | -1.725 |
| 904 | -0.364 | 1.05 | -1.723 |
| 905 | 2.28 | 1.05 | -1.723 |
| 906 | 2.087 | 1.075 | -1.762 |
| 907 | -0.025 | 1.104 | -1.811 |
| 908 | -0.113 | 1.103 | -1.809 |
| 909 | 0.725 | 1.099 | -1.803 |
| 910 | -1.546 | 1.104 | -1.811 |
| 911 | -0.423 | 1.117 | -1.832 |
| 912 | -0.567 | 1.088 | -1.784 |
| 913 | -0.284 | 1.085 | -1.78 |
| 914 | 0.588 | 1.083 | -1.777 |
| 915 | 0.641 | 1.085 | -1.779 |
| 916 | -0.477 | 1.074 | -1.761 |
| 917 | -1.112 | 1.074 | -1.761 |
| 918 | 0.795 | 1.073 | -1.76 |
| 919 | -1.478 | 1.076 | -1.765 |
| 920 | -0.018 | 1.088 | -1.784 |
| 921 | 1.615 | 1.086 | -1.782 |
| 922 | -2.117 | 1.108 | -1.817 |
| 923 | 1.21 | 1.117 | -1.832 |
| 924 | -1.007 | 1.127 | -1.848 |
| 925 | 0.637 | 1.117 | -1.832 |
| 926 | 0.086 | 1.12 | -1.838 |
| 927 | -0.097 | 1.083 | -1.776 |
| 928 | -1.384 | 1.074 | -1.761 |
| 929 | -1.329 | 1.078 | -1.768 |
| 930 | 1.576 | 1.085 | -1.78 |
| 931 | 0.963 | 1.098 | -1.801 |
| 932 | -0.426 | 1.102 | -1.806 |
| 933 | 1.85 | 1.101 | -1.806 |
| 934 | 0.224 | 1.128 | -1.851 |
| 935 | 1.197 | 1.124 | -1.843 |
| 936 | 0.646 | 1.132 | -1.856 |
| 937 | 0.552 | 1.087 | -1.782 |
| 938 | -0.35 | 1.089 | -1.786 |
| 939 | 0.854 | 1.09 | -1.787 |
| 940 | 1.693 | 1.093 | -1.793 |
| 941 | -0.64 | 1.085 | -1.779 |
| 942 | -1.624 | 1.086 | -1.781 |
| 943 | -1.022 | 1.083 | -1.776 |
| 944 | 0.386 | 1.082 | -1.775 |
| 945 | 1.979 | 1.079 | -1.769 |
| 946 | -0.521 | 1.111 | -1.821 |
| 947 | 0.282 | 1.081 | -1.772 |
| 948 | -0.084 | 1.081 | -1.774 |
| 949 | 0.15 | 1.079 | -1.769 |
| 950 | -0.401 | 1.078 | -1.768 |
| 951 | 0.626 | 1.078 | -1.767 |
| 952 | 1.432 | 1.079 | -1.77 |
| 953 | -0.376 | 1.076 | -1.765 |
| 954 | -0.099 | 1.077 | -1.766 |
| 955 | -0.302 | 1.056 | -1.732 |
| 956 | -0.553 | 1.055 | -1.73 |
| 957 | 0.247 | 1.05 | -1.722 |
| 958 | -0.5 | 1.049 | -1.72 |
| 959 | 0.259 | 1.046 | -1.716 |
| 960 | -0.793 | 1.037 | -1.7 |
| 961 | -0.401 | 1.041 | -1.707 |
| 962 | -2.498 | 1.028 | -1.686 |
| 963 | 0.289 | 1.042 | -1.709 |
| 964 | -2.782 | 1.04 | -1.705 |
| 965 | -1.5 | 1.084 | -1.778 |
| 966 | 0.65 | 1.073 | -1.759 |
| 967 | -0.106 | 1.076 | -1.764 |
| 968 | -0.56 | 1.075 | -1.763 |
| 969 | 0.879 | 1.073 | -1.76 |
| 970 | 0.239 | 1.078 | -1.768 |
| 971 | -1.769 | 1.077 | -1.767 |
| 972 | -0.508 | 1.061 | -1.74 |
| 973 | -0.225 | 1.028 | -1.685 |
| 974 | -0.274 | 1.028 | -1.686 |
| 975 | 1.337 | 1.028 | -1.686 |
| 976 | -1.259 | 1.038 | -1.703 |
| 977 | -1.704 | 1.033 | -1.694 |
| 978 | -0.817 | 1.051 | -1.724 |
| 979 | 0.783 | 1.053 | -1.727 |
| 980 | 0.573 | 1.059 | -1.736 |
| 981 | -1.538 | 1.058 | -1.736 |
| 982 | -0.995 | 1.069 | -1.753 |
| 983 | -1.518 | 1.073 | -1.76 |
| 984 | 0.906 | 1.08 | -1.772 |
| 985 | 2.094 | 1.082 | -1.774 |
| 986 | 0.953 | 1.103 | -1.809 |
| 987 | -0.385 | 1.111 | -1.821 |
| 988 | 1.037 | 1.091 | -1.789 |
| 989 | 1.264 | 1.07 | -1.755 |
| 990 | -0.807 | 1.071 | -1.757 |
| 991 | -0.733 | 1.069 | -1.753 |
| 992 | 1.935 | 1.068 | -1.752 |
| 993 | 0.319 | 1.097 | -1.798 |
| 994 | 0.235 | 1.097 | -1.8 |
| 995 | 0.72 | 1.085 | -1.779 |
| 996 | 0.48 | 1.076 | -1.765 |
| 997 | -0.535 | 1.06 | -1.738 |
| 998 | 0.494 | 1.055 | -1.73 |
| 999 | -2.137 | 1.056 | -1.731 |
| 1000 | -0.676 | 1.062 | -1.741 |
| 1001 | 0.345 | 1.064 | -1.744 |
| 1002 | 1.069 | 1.053 | -1.727 |
| 1003 | 0.837 | 1.059 | -1.737 |
| 1004 | 0.19 | 1.062 | -1.742 |
| 1005 | 0.959 | 1.062 | -1.742 |
| 1006 | -2.021 | 1.064 | -1.744 |
| 1007 | -2.06 | 1.067 | -1.75 |
| 1008 | 0.253 | 1.091 | -1.79 |
| 1009 | -0.555 | 1.077 | -1.766 |
| 1010 | 0.403 | 1.072 | -1.758 |
| 1011 | -0.634 | 1.072 | -1.759 |
| 1012 | -0.305 | 1.042 | -1.708 |
| 1013 | -0.831 | 1.041 | -1.707 |
| 1014 | 0.338 | 1.043 | -1.71 |
| 1015 | -0.409 | 1.044 | -1.713 |
| 1016 | -0.529 | 1.044 | -1.712 |
| 1017 | -0.163 | 1.045 | -1.713 |
| 1018 | 0.516 | 1.04 | -1.705 |
| 1019 | -0.678 | 1.024 | -1.679 |
| 1020 | -0.774 | 1.025 | -1.682 |
| 1021 | 0.498 | 1.028 | -1.685 |
| 1022 | -2.219 | 1.031 | -1.691 |
| 1023 | 0.679 | 1.06 | -1.738 |
| 1024 | 0.317 | 1.064 | -1.745 |
| 1025 | 0.862 | 1.066 | -1.748 |
| 1026 | -0.807 | 1.072 | -1.759 |
| 1027 | 1.362 | 1.073 | -1.759 |
| 1028 | 2.567 | 1.089 | -1.786 |
| 1029 | 1.324 | 1.101 | -1.806 |
| 1030 | 0.749 | 1.114 | -1.827 |
| 1031 | 0.402 | 1.066 | -1.749 |
| 1032 | 0.924 | 1.052 | -1.725 |
| 1033 | -1.361 | 1.055 | -1.73 |
| 1034 | -0.835 | 1.068 | -1.752 |
| 1035 | -0.554 | 1.071 | -1.756 |
| 1036 | 0.031 | 1.067 | -1.75 |
| 1037 | -1.062 | 1.066 | -1.749 |
| 1038 | -1.147 | 1.052 | -1.725 |
| 1039 | 1.571 | 1.059 | -1.738 |
| 1040 | -0.195 | 1.078 | -1.767 |
| 1041 | -0.522 | 1.077 | -1.767 |
| 1042 | -0.008 | 1.066 | -1.748 |
| 1043 | 0.659 | 1.055 | -1.73 |
| 1044 | -1.415 | 1.037 | -1.7 |
| 1045 | 0.565 | 1.047 | -1.717 |
| 1046 | 1.364 | 1.045 | -1.713 |
| 1047 | 1.033 | 1.056 | -1.732 |
| 1048 | 0.11 | 1.045 | -1.714 |
| 1049 | 0.458 | 1.037 | -1.701 |
| 1050 | -0.287 | 1.019 | -1.671 |
| 1051 | 0.544 | 1.015 | -1.664 |
| 1052 | -1.317 | 0.985 | -1.615 |
| 1053 | 0.861 | 0.993 | -1.628 |
| 1054 | 0.675 | 0.997 | -1.635 |
| 1055 | 0.543 | 0.992 | -1.627 |
| 1056 | -1.338 | 0.982 | -1.611 |
| 1057 | -0.434 | 0.991 | -1.626 |
| 1058 | 1.067 | 0.989 | -1.621 |
| 1059 | -1.681 | 0.968 | -1.588 |
| 1060 | -2.111 | 0.989 | -1.623 |
| 1061 | -0.58 | 1.022 | -1.676 |
| 1062 | 0.405 | 1.019 | -1.671 |
| 1063 | 1.798 | 1.018 | -1.67 |
| 1064 | 1.572 | 1.043 | -1.71 |
| 1065 | -0.478 | 1.059 | -1.737 |
| 1066 | -0.405 | 1.028 | -1.686 |
| 1067 | 0.143 | 1.026 | -1.682 |
| 1068 | 0.677 | 1.025 | -1.681 |
| 1069 | 0.588 | 1.02 | -1.672 |
| 1070 | -0.094 | 1.017 | -1.668 |
| 1071 | 0.512 | 1.017 | -1.667 |
| 1072 | 0.081 | 1.012 | -1.659 |
| 1073 | 0.557 | 0.98 | -1.608 |
| 1074 | -1.122 | 0.948 | -1.554 |
| 1075 | 0.779 | 0.958 | -1.571 |
| 1076 | -1.023 | 0.96 | -1.574 |
| 1077 | -3.982 | 0.968 | -1.587 |
| 1078 | 0.205 | 1.084 | -1.777 |
| 1079 | -0.168 | 1.083 | -1.777 |
| 1080 | 0.798 | 1.079 | -1.769 |
| 1081 | 0.263 | 1.083 | -1.775 |
| 1082 | -0.853 | 1.082 | -1.774 |
| 1083 | 1.227 | 1.085 | -1.779 |
| 1084 | 1.199 | 1.095 | -1.796 |
| 1085 | 2.058 | 1.103 | -1.809 |
| 1086 | 0.787 | 1.127 | -1.848 |
| 1087 | 0.74 | 1.125 | -1.845 |
| 1088 | -0.232 | 1.127 | -1.848 |
| 1089 | 0.082 | 1.09 | -1.787 |
| 1090 | 1.164 | 1.087 | -1.783 |
| 1091 | 0.715 | 1.095 | -1.795 |
| 1092 | -1.245 | 1.093 | -1.793 |
| 1093 | -0.045 | 1.1 | -1.805 |
| 1094 | -0.065 | 1.09 | -1.787 |
| 1095 | 1.215 | 1.046 | -1.715 |
| 1096 | -1.198 | 1.044 | -1.712 |
| 1097 | -1.086 | 1.052 | -1.725 |
| 1098 | 0.365 | 1.06 | -1.738 |
| 1099 | -0.173 | 1.055 | -1.73 |
| 1100 | 0.506 | 1.041 | -1.707 |
| 1101 | 0.23 | 1.037 | -1.701 |
| 1102 | 0.853 | 1.035 | -1.697 |
| 1103 | 1.9 | 1.039 | -1.704 |
| 1104 | 0.11 | 1.053 | -1.727 |
| 1105 | 0.69 | 1.041 | -1.708 |
| 1106 | -0.651 | 1.028 | -1.686 |
| 1107 | -1.467 | 1.032 | -1.692 |
| 1108 | 1.808 | 1.047 | -1.718 |
| 1109 | 0.045 | 1.068 | -1.752 |
| 1110 | 0.823 | 1.066 | -1.748 |
| 1111 | -0.369 | 1.052 | -1.725 |
| 1112 | -0.13 | 1.053 | -1.727 |
| 1113 | -0.371 | 1.042 | -1.709 |
| 1114 | 0.825 | 1.037 | -1.701 |
| 1115 | 0.744 | 1.041 | -1.708 |
| 1116 | -0.978 | 1.043 | -1.711 |
| 1117 | 0.324 | 1.051 | -1.723 |
| 1118 | 1.647 | 1.05 | -1.722 |
| 1119 | 1.292 | 1.052 | -1.725 |
| 1120 | 1.105 | 1.058 | -1.734 |
| 1121 | -0.88 | 1.062 | -1.742 |
| 1122 | 0.107 | 1.069 | -1.753 |
| 1123 | 0.252 | 1.053 | -1.726 |
| 1124 | -0.173 | 1.05 | -1.722 |
| 1125 | -1.166 | 1.045 | -1.714 |
| 1126 | -0.331 | 1.033 | -1.694 |
| 1127 | 0.584 | 0.995 | -1.632 |
| 1128 | 1.424 | 0.992 | -1.627 |
| 1129 | 1.569 | 1.003 | -1.645 |
| 1130 | 0.247 | 0.998 | -1.637 |
| 1131 | 1.757 | 0.983 | -1.613 |
| 1132 | -0.431 | 0.998 | -1.637 |
| 1133 | -0.057 | 0.999 | -1.638 |
| 1134 | 1.167 | 0.999 | -1.639 |
| 1135 | 1.954 | 1.004 | -1.647 |
| 1136 | -0.109 | 1.026 | -1.682 |
| 1137 | -1.096 | 1.026 | -1.682 |
| 1138 | -1.808 | 1.039 | -1.703 |
| 1139 | -0.871 | 1.068 | -1.752 |
| 1140 | -0.888 | 1.075 | -1.763 |
| 1141 | -0.673 | 1.071 | -1.757 |
| 1142 | -0.627 | 1.074 | -1.761 |
| 1143 | -0.647 | 1.068 | -1.752 |
| 1144 | -0.945 | 0.94 | -1.542 |
| 1145 | -0.549 | 0.951 | -1.56 |
| 1146 | 0.035 | 0.954 | -1.565 |
| 1147 | 0.059 | 0.951 | -1.56 |
| 1148 | -0.236 | 0.952 | -1.56 |
| 1149 | -0.935 | 0.944 | -1.549 |
| 1150 | -1.252 | 0.945 | -1.55 |
| 1151 | -0.335 | 0.951 | -1.56 |
| 1152 | -1.584 | 0.921 | -1.511 |
| 1153 | 0.766 | 0.939 | -1.54 |
| 1154 | -1.254 | 0.939 | -1.541 |
| 1155 | 0.871 | 0.952 | -1.562 |
| 1156 | 1.102 | 0.958 | -1.571 |
| 1157 | -0.709 | 0.957 | -1.569 |
| 1158 | 0.461 | 0.957 | -1.57 |
| 1159 | -2.766 | 0.946 | -1.551 |
| 1160 | -1.16 | 1.007 | -1.652 |
| 1161 | -1.197 | 1.017 | -1.668 |
| 1162 | -0.662 | 1.016 | -1.665 |
| 1163 | -2.12 | 1.008 | -1.654 |
| 1164 | 0.711 | 1.032 | -1.693 |
| 1165 | 0.838 | 1.036 | -1.698 |
| 1166 | 0.212 | 1.041 | -1.708 |
| 1167 | 0.413 | 1.04 | -1.705 |
| 1168 | 0.546 | 1.04 | -1.706 |
| 1169 | 0.973 | 1.037 | -1.701 |
| 1170 | -0.346 | 1.016 | -1.667 |
| 1171 | 0.857 | 1.017 | -1.668 |
| 1172 | 0.012 | 1.019 | -1.671 |
| 1173 | -1.197 | 1.016 | -1.667 |
| 1174 | -0.35 | 1.011 | -1.658 |
| 1175 | -0.558 | 0.985 | -1.615 |
| 1176 | 0.185 | 0.986 | -1.617 |
| 1177 | 0.519 | 0.98 | -1.607 |
| 1178 | -1.317 | 0.983 | -1.611 |
| 1179 | 0.479 | 0.994 | -1.63 |
| 1180 | -0.198 | 0.996 | -1.634 |
| 1181 | 0.83 | 0.99 | -1.623 |
| 1182 | 1.094 | 0.991 | -1.625 |
| 1183 | -0.719 | 0.996 | -1.633 |
| 1184 | 0.906 | 0.997 | -1.636 |
| 1185 | -0.283 | 0.982 | -1.61 |
| 1186 | 1.974 | 0.966 | -1.584 |
| 1187 | 0.252 | 0.989 | -1.622 |
| 1188 | 1.542 | 0.985 | -1.616 |
| 1189 | 0.104 | 1.005 | -1.649 |
| 1190 | 0.276 | 1.005 | -1.648 |
| 1191 | 1.053 | 1.006 | -1.649 |
| 1192 | 0.415 | 1.006 | -1.649 |
| 1193 | -1.115 | 1.006 | -1.65 |
| 1194 | -1.209 | 1.012 | -1.66 |
| 1195 | 0.286 | 1.005 | -1.648 |
| 1196 | -0.681 | 0.985 | -1.615 |
| 1197 | 0.479 | 0.986 | -1.617 |
| 1198 | 0.753 | 0.961 | -1.576 |
| 1199 | -1.698 | 0.966 | -1.585 |
| 1200 | 0.671 | 0.986 | -1.616 |
| 1201 | 1.49 | 0.977 | -1.603 |
| 1202 | -0.198 | 0.963 | -1.58 |
| 1203 | -0.498 | 0.963 | -1.58 |
| 1204 | -0.42 | 0.957 | -1.57 |
| 1205 | -0.458 | 0.935 | -1.534 |
| 1206 | 1.352 | 0.932 | -1.528 |
| 1207 | -0.451 | 0.944 | -1.549 |
| 1208 | -0.173 | 0.943 | -1.546 |
| 1209 | -0.786 | 0.94 | -1.542 |
| 1210 | -0.848 | 0.942 | -1.545 |
| 1211 | -0.307 | 0.941 | -1.543 |
| 1212 | 0.345 | 0.939 | -1.54 |
| 1213 | -0.116 | 0.941 | -1.543 |
| 1214 | 0.638 | 0.94 | -1.542 |
| 1215 | 0.159 | 0.944 | -1.549 |
| 1216 | 0.167 | 0.939 | -1.539 |
| 1217 | -0.196 | 0.927 | -1.52 |
| 1218 | 1.978 | 0.926 | -1.519 |
| 1219 | 0.65 | 0.938 | -1.538 |
| 1220 | -0.826 | 0.937 | -1.536 |
| 1221 | 0.503 | 0.929 | -1.524 |
| 1222 | 1.084 | 0.925 | -1.517 |
| 1223 | -0.677 | 0.925 | -1.516 |
| 1224 | 0.753 | 0.924 | -1.516 |
| 1225 | -1.408 | 0.927 | -1.52 |
| 1226 | -1.408 | 0.878 | -1.44 |
| 1227 | -1.164 | 0.884 | -1.449 |
| 1228 | 0.499 | 0.883 | -1.448 |
| 1229 | -0.744 | 0.88 | -1.443 |
| 1230 | 0.878 | 0.843 | -1.383 |
| 1231 | -0.509 | 0.845 | -1.386 |
| 1232 | 1.007 | 0.843 | -1.383 |
| 1233 | -0.724 | 0.851 | -1.395 |
| 1234 | 1.058 | 0.856 | -1.403 |
| 1235 | -2.573 | 0.862 | -1.414 |
| 1236 | -0.951 | 0.914 | -1.499 |
| 1237 | 1.177 | 0.921 | -1.51 |
| 1238 | -1.6 | 0.926 | -1.519 |
| 1239 | -1.398 | 0.947 | -1.553 |
| 1240 | 0.019 | 0.951 | -1.56 |
| 1241 | -2.413 | 0.95 | -1.559 |
| 1242 | 0.511 | 0.993 | -1.629 |
| 1243 | -0.938 | 0.995 | -1.632 |
| 1244 | -0.428 | 0.999 | -1.638 |
| 1245 | 0.471 | 0.988 | -1.62 |
| 1246 | -0.439 | 0.988 | -1.62 |
| 1247 | 0.601 | 0.989 | -1.621 |
| 1248 | -0.702 | 0.986 | -1.617 |
| 1249 | -0.296 | 0.979 | -1.605 |
| 1250 | 1.202 | 0.976 | -1.6 |
| 1251 | -0.592 | 0.981 | -1.609 |
| 1252 | -0.405 | 0.983 | -1.612 |
| 1253 | 0.218 | 0.95 | -1.558 |
| 1254 | -0.123 | 0.95 | -1.557 |
| 1255 | -0.795 | 0.927 | -1.52 |
| 1256 | 0.639 | 0.93 | -1.525 |
| 1257 | 0.227 | 0.934 | -1.531 |
| 1258 | -0.965 | 0.923 | -1.514 |
| 1259 | -0.55 | 0.925 | -1.518 |
| 1260 | -0.665 | 0.919 | -1.508 |
| 1261 | -0.186 | 0.912 | -1.496 |
| 1262 | -0.74 | 0.91 | -1.493 |
| 1263 | 0.202 | 0.911 | -1.494 |
| 1264 | 0.56 | 0.909 | -1.49 |
| 1265 | -0.888 | 0.906 | -1.486 |
| 1266 | 0.689 | 0.89 | -1.46 |
| 1267 | -0.127 | 0.891 | -1.461 |
| 1268 | -0.261 | 0.866 | -1.421 |
| 1269 | 1.062 | 0.866 | -1.421 |
| 1270 | 2.128 | 0.879 | -1.441 |
| 1271 | 0.24 | 0.922 | -1.513 |
| 1272 | 3.114 | 0.922 | -1.513 |
| 1273 | 0.938 | 0.989 | -1.621 |
| 1274 | -0.293 | 0.995 | -1.632 |
| 1275 | -0.24 | 0.996 | -1.633 |
| 1276 | 1.225 | 0.992 | -1.627 |
| 1277 | -0.493 | 0.999 | -1.639 |
| 1278 | 0.209 | 1 | -1.641 |
| 1279 | 2.194 | 1 | -1.639 |
| 1280 | -1.056 | 1.036 | -1.7 |
| 1281 | 0.009 | 1.041 | -1.708 |
| 1282 | -0.621 | 1.041 | -1.708 |
| 1283 | -1.566 | 1.043 | -1.711 |
| 1284 | -0.66 | 1.06 | -1.739 |
| 1285 | 0.596 | 1.032 | -1.692 |
| 1286 | -0.616 | 1.031 | -1.691 |
| 1287 | 0.207 | 1.029 | -1.688 |
| 1288 | -0.019 | 1.027 | -1.685 |
| 1289 | -0.527 | 1.017 | -1.667 |
| 1290 | 0.61 | 1.015 | -1.665 |
| 1291 | 1.015 | 1.014 | -1.662 |
| 1292 | 0.474 | 1.01 | -1.656 |
| 1293 | 1.031 | 0.998 | -1.637 |
| 1294 | 0.969 | 0.997 | -1.636 |
| 1295 | 0.059 | 1.003 | -1.644 |
| 1296 | -2.84 | 0.998 | -1.638 |
| 1297 | -1.264 | 1.052 | -1.725 |
| 1298 | -0.679 | 1.061 | -1.74 |
| 1299 | 0.076 | 1.055 | -1.73 |
| 1300 | -0.062 | 1.052 | -1.726 |
| 1301 | 0.596 | 1.043 | -1.71 |
| 1302 | -1.58 | 0.999 | -1.638 |
| 1303 | 0.052 | 1.01 | -1.657 |
| 1304 | 0.6 | 0.999 | -1.638 |
| 1305 | 0.491 | 0.984 | -1.613 |
| 1306 | 0.81 | 0.971 | -1.592 |
| 1307 | -0.05 | 0.976 | -1.601 |
| 1308 | 1.358 | 0.928 | -1.523 |
| 1309 | -1.429 | 0.941 | -1.543 |
| 1310 | -0.28 | 0.951 | -1.559 |
| 1311 | 0.784 | 0.95 | -1.558 |
| 1312 | -1.143 | 0.953 | -1.562 |
| 1313 | -1.154 | 0.962 | -1.578 |
| 1314 | -0.382 | 0.97 | -1.592 |
| 1315 | -0.251 | 0.968 | -1.587 |
| 1316 | -0.821 | 0.967 | -1.587 |
| 1317 | 0.977 | 0.961 | -1.577 |
| 1318 | 0.552 | 0.966 | -1.585 |
| 1319 | -1.243 | 0.967 | -1.586 |
| 1320 | -0.909 | 0.979 | -1.606 |
| 1321 | 1.952 | 0.986 | -1.616 |
| 1322 | 0.746 | 1.01 | -1.656 |
| 1323 | -0.298 | 1.011 | -1.658 |
| 1324 | -0.281 | 1.011 | -1.658 |
| 1325 | -1.223 | 1.004 | -1.647 |
| 1326 | -0.943 | 1.014 | -1.663 |
| 1327 | 0.197 | 1.017 | -1.668 |
| 1328 | -1.241 | 1.017 | -1.668 |
| 1329 | -0.101 | 1.025 | -1.681 |
| 1330 | 0.243 | 1.025 | -1.68 |
| 1331 | 2.338 | 1.023 | -1.677 |
| 1332 | -0.524 | 1.056 | -1.732 |
| 1333 | 1.794 | 1.055 | -1.731 |
| 1334 | 1.314 | 1.077 | -1.766 |
| 1335 | -1.207 | 1.087 | -1.782 |
| 1336 | -1.556 | 1.092 | -1.79 |
| 1337 | 0.474 | 1.078 | -1.768 |
| 1338 | -0.117 | 1.079 | -1.77 |
| 1339 | -0.412 | 1.007 | -1.652 |
| 1340 | 0.64 | 1.001 | -1.641 |
| 1341 | 0.831 | 1.004 | -1.646 |
| 1342 | -0.326 | 1.009 | -1.655 |
| 1343 | -0.917 | 0.998 | -1.636 |
| 1344 | -0.077 | 1.002 | -1.643 |
| 1345 | 0.058 | 1.001 | -1.642 |
| 1346 | -0.538 | 0.961 | -1.576 |
| 1347 | -0.067 | 0.955 | -1.566 |
| 1348 | -1.477 | 0.955 | -1.566 |
| 1349 | 1.163 | 0.968 | -1.587 |
| 1350 | -0.575 | 0.963 | -1.579 |
| 1351 | -0.376 | 0.962 | -1.578 |
| 1352 | 0.144 | 0.959 | -1.573 |
| 1353 | -1.207 | 0.957 | -1.57 |
| 1354 | 0.354 | 0.967 | -1.586 |
| 1355 | -1.149 | 0.968 | -1.588 |
| 1356 | 2.05 | 0.976 | -1.6 |
| 1357 | -1.502 | 1.007 | -1.652 |
| 1358 | 0.473 | 1.013 | -1.662 |
| 1359 | 1.286 | 1.013 | -1.662 |
| 1360 | 1.343 | 1.018 | -1.67 |
| 1361 | -0.821 | 1.025 | -1.681 |
| 1362 | 0.062 | 1.029 | -1.687 |
| 1363 | -0.579 | 0.971 | -1.592 |
| 1364 | 0.626 | 0.961 | -1.577 |
| 1365 | -0.251 | 0.962 | -1.577 |
| 1366 | 0.537 | 0.962 | -1.578 |
| 1367 | 1.573 | 0.965 | -1.582 |
| 1368 | -1.589 | 0.982 | -1.61 |
| 1369 | 0.788 | 0.982 | -1.611 |
| 1370 | 0.745 | 0.987 | -1.619 |
| 1371 | 0.248 | 0.989 | -1.621 |
| 1372 | 0.858 | 0.987 | -1.619 |
| 1373 | -1.319 | 0.988 | -1.62 |
| 1374 | -0.396 | 1.001 | -1.641 |
| 1375 | -0.134 | 0.987 | -1.618 |
| 1376 | -0.068 | 0.972 | -1.594 |
| 1377 | -0.254 | 0.971 | -1.593 |
| 1378 | -0.443 | 0.966 | -1.585 |
| 1379 | -1.79 | 0.958 | -1.571 |
| 1380 | -1.165 | 0.972 | -1.595 |
| 1381 | 1.652 | 0.981 | -1.609 |
| 1382 | -0.446 | 1.003 | -1.645 |
| 1383 | 0.633 | 1 | -1.64 |
| 1384 | 0.833 | 0.995 | -1.632 |
| 1385 | -0.089 | 0.998 | -1.637 |
| 1386 | 0.391 | 0.987 | -1.618 |
| 1387 | 0.641 | 0.981 | -1.61 |
| 1388 | 0.397 | 0.954 | -1.565 |
| 1389 | 1.906 | 0.951 | -1.56 |
| 1390 | -1.596 | 0.979 | -1.606 |
| 1391 | 0.041 | 0.999 | -1.638 |
| 1392 | 0.733 | 0.987 | -1.619 |
| 1393 | -0.745 | 0.983 | -1.613 |
| 1394 | 0.469 | 0.988 | -1.62 |
| 1395 | 0.785 | 0.976 | -1.601 |
| 1396 | -0.125 | 0.98 | -1.608 |
| 1397 | 0.976 | 0.98 | -1.608 |
| 1398 | -0.353 | 0.945 | -1.55 |
| 1399 | 0.715 | 0.944 | -1.548 |
| 1400 | 1.575 | 0.922 | -1.513 |
| 1401 | 0.713 | 0.929 | -1.523 |
| 1402 | -0.211 | 0.919 | -1.507 |
| 1403 | -1.176 | 0.897 | -1.471 |
| 1404 | 0.786 | 0.909 | -1.491 |
| 1405 | 0.838 | 0.913 | -1.498 |
| 1406 | 0.683 | 0.916 | -1.502 |
| 1407 | -0.869 | 0.916 | -1.503 |
| 1408 | -2.244 | 0.919 | -1.507 |
| 1409 | -1.756 | 0.961 | -1.576 |
| 1410 | -0.407 | 0.979 | -1.606 |
| 1411 | -1.292 | 0.981 | -1.608 |
| 1412 | -0.257 | 0.994 | -1.63 |
| 1413 | -3.436 | 0.992 | -1.627 |
| 1414 | 0.801 | 1.079 | -1.769 |
| 1415 | -0.805 | 1.069 | -1.753 |
| 1416 | 1.454 | 1.063 | -1.743 |
| 1417 | -0.734 | 1.077 | -1.765 |
| 1418 | -0.763 | 1.079 | -1.77 |
| 1419 | 0.274 | 1.083 | -1.776 |
| 1420 | -0.147 | 1.074 | -1.761 |
| 1421 | 1.132 | 1.073 | -1.759 |
| 1422 | -2.455 | 1.072 | -1.759 |
| 1423 | 0.944 | 1.084 | -1.778 |
| 1424 | 0.477 | 1.076 | -1.764 |
| 1425 | -1.088 | 1.076 | -1.764 |
| 1426 | 1.253 | 1.071 | -1.757 |
| 1427 | 0.227 | 1.07 | -1.754 |
| 1428 | -0.24 | 1.066 | -1.748 |
| 1429 | -1.395 | 1.066 | -1.748 |
| 1430 | 1.201 | 1.077 | -1.766 |
| 1431 | 1.331 | 1.085 | -1.779 |
| 1432 | -0.346 | 1.098 | -1.8 |
| 1433 | -1.255 | 1.096 | -1.798 |
| 1434 | 0.025 | 1.088 | -1.784 |
| 1435 | -1.221 | 1.071 | -1.757 |
| 1436 | -0.694 | 1.075 | -1.764 |
| 1437 | -2.055 | 1.073 | -1.76 |
| 1438 | -0.886 | 1.099 | -1.802 |
| 1439 | -0.629 | 1.095 | -1.796 |
| 1440 | -0.986 | 1.087 | -1.783 |
| 1441 | -0.96 | 1.092 | -1.791 |
| 1442 | 0.326 | 1.096 | -1.798 |
| 1443 | 0.039 | 1.098 | -1.801 |
| 1444 | -1.666 | 1.098 | -1.801 |
| 1445 | 1.297 | 1.113 | -1.826 |
| 1446 | -1.822 | 1.109 | -1.819 |
| 1447 | 0.714 | 1.122 | -1.84 |
| 1448 | 0.37 | 1.104 | -1.811 |
| 1449 | 1.038 | 1.106 | -1.813 |
| 1450 | -1.698 | 1.111 | -1.822 |
| 1451 | 0.512 | 1.121 | -1.838 |
| 1452 | 0.095 | 1.124 | -1.843 |
| 1453 | 0.171 | 1.122 | -1.84 |
| 1454 | -0.782 | 1.118 | -1.834 |
| 1455 | 0.456 | 1.118 | -1.834 |
| 1456 | 0.388 | 1.09 | -1.788 |
| 1457 | -1.567 | 1.079 | -1.77 |
| 1458 | 0.312 | 1.092 | -1.791 |
| 1459 | 1.019 | 1.087 | -1.783 |
| 1460 | -0.354 | 1.096 | -1.797 |
| 1461 | -1.267 | 1.093 | -1.793 |
| 1462 | -0.103 | 1.094 | -1.793 |
| 1463 | -0.763 | 1.094 | -1.793 |
| 1464 | -0.576 | 1.085 | -1.779 |
| 1465 | 0.115 | 1.085 | -1.78 |
| 1466 | 0.523 | 1.08 | -1.77 |
| 1467 | -1.839 | 1.059 | -1.737 |
| 1468 | -0.827 | 1.069 | -1.752 |
| 1469 | -1.75 | 1.07 | -1.755 |
| 1470 | -1.406 | 1.079 | -1.77 |
| 1471 | -0.483 | 1.078 | -1.767 |
| 1472 | -0.262 | 1.067 | -1.749 |
| 1473 | 0.366 | 1.058 | -1.735 |
| 1474 | -0.041 | 1.061 | -1.74 |
| 1475 | 0.266 | 1.036 | -1.7 |
| 1476 | -0.2 | 1.025 | -1.68 |
| 1477 | -1.424 | 1.025 | -1.68 |
| 1478 | -0.672 | 1.027 | -1.684 |
| 1479 | 0.022 | 1.027 | -1.685 |
| 1480 | 1.124 | 0.953 | -1.562 |
| 1481 | -0.891 | 0.959 | -1.573 |
| 1482 | -2.426 | 0.96 | -1.574 |
| 1483 | 0.83 | 0.97 | -1.592 |
| 1484 | 0.365 | 0.98 | -1.607 |
| 1485 | 0.53 | 0.982 | -1.61 |
| 1486 | 0.115 | 0.985 | -1.615 |
| 1487 | -0.7 | 0.986 | -1.617 |
| 1488 | 1.435 | 0.971 | -1.592 |
| 1489 | -1.995 | 0.957 | -1.57 |
| 1490 | 0.695 | 0.968 | -1.588 |
| 1491 | 0.779 | 0.972 | -1.593 |
| 1492 | 0.306 | 0.976 | -1.6 |
| 1493 | -1.132 | 0.96 | -1.574 |
| 1494 | -2.587 | 0.963 | -1.579 |
| 1495 | -0.119 | 1.003 | -1.644 |
| 1496 | 0.616 | 0.994 | -1.631 |
| 1497 | -0.036 | 0.983 | -1.612 |
| 1498 | -0.567 | 0.962 | -1.577 |
| 1499 | -0.468 | 0.962 | -1.578 |
| 1500 | -0.396 | 0.956 | -1.567 |
| 1501 | 1.604 | 0.954 | -1.565 |
| 1502 | -0.581 | 0.978 | -1.604 |
| 1503 | -0.276 | 0.978 | -1.603 |
| 1504 | -0.536 | 0.953 | -1.563 |
| 1505 | -0.111 | 0.95 | -1.559 |
| 1506 | -1.083 | 0.95 | -1.557 |
| 1507 | -1.081 | 0.951 | -1.559 |
| 1508 | -0.45 | 0.952 | -1.562 |
| 1509 | 0.192 | 0.95 | -1.557 |
| 1510 | 0.606 | 0.951 | -1.559 |
| 1511 | -0.671 | 0.941 | -1.543 |
| 1512 | -1.263 | 0.922 | -1.512 |
| 1513 | -1.165 | 0.91 | -1.493 |
| 1514 | -1.512 | 0.908 | -1.49 |
| 1515 | -1.639 | 0.917 | -1.503 |
| 1516 | 0.256 | 0.914 | -1.5 |
| 1517 | -1.474 | 0.902 | -1.48 |
| 1518 | -0.697 | 0.907 | -1.487 |
| 1519 | 1.985 | 0.906 | -1.485 |
| 1520 | -0.433 | 0.949 | -1.556 |
| 1521 | -2.043 | 0.948 | -1.554 |
| 1522 | 1.832 | 0.965 | -1.582 |
| 1523 | -1.749 | 0.998 | -1.637 |
| 1524 | 1.748 | 1.002 | -1.643 |
| 1525 | -0.358 | 1.032 | -1.693 |
| 1526 | 1.06 | 1.018 | -1.669 |
| 1527 | 0.667 | 1.033 | -1.694 |
| 1528 | -0.006 | 1.034 | -1.695 |
| 1529 | 0.5 | 1.034 | -1.696 |
| 1530 | -0.159 | 1.037 | -1.701 |
| 1531 | -0.075 | 1.037 | -1.7 |
| 1532 | -0.033 | 1.036 | -1.699 |
| 1533 | 0.563 | 1.032 | -1.692 |
| 1534 | 0.669 | 1.019 | -1.671 |
| 1535 | -0.072 | 1.023 | -1.677 |
| 1536 | -0.912 | 1.005 | -1.648 |
| 1537 | -1.354 | 0.998 | -1.637 |
| 1538 | 2.413 | 1.007 | -1.652 |
| 1539 | 1.75 | 1.058 | -1.735 |
| 1540 | 0.333 | 1.083 | -1.775 |
| 1541 | 1.092 | 1.084 | -1.778 |
| 1542 | -0.512 | 1.094 | -1.794 |
| 1543 | -1.02 | 1.095 | -1.795 |
| 1544 | -0.279 | 1.089 | -1.785 |
| 1545 | -0.824 | 1.087 | -1.782 |
| 1546 | 1.814 | 1.09 | -1.787 |
| 1547 | 0.861 | 1.105 | -1.813 |
| 1548 | 0.583 | 1.108 | -1.817 |
| 1549 | 0.39 | 1.073 | -1.759 |
| 1550 | 0.497 | 1.068 | -1.752 |
| 1551 | 0.248 | 1.069 | -1.754 |
| 1552 | 1.121 | 1.067 | -1.751 |
| 1553 | 1.549 | 1.077 | -1.767 |
| 1554 | -0.666 | 1.092 | -1.791 |
| 1555 | 0.999 | 1.079 | -1.77 |
| 1556 | -1.237 | 1.059 | -1.737 |
| 1557 | 0.953 | 1.066 | -1.749 |
| 1558 | -0.814 | 1.069 | -1.752 |
| 1559 | 0.961 | 1.072 | -1.758 |
| 1560 | 0.193 | 1.07 | -1.756 |
| 1561 | 1.678 | 1.021 | -1.675 |
| 1562 | -0.162 | 1.041 | -1.708 |
| 1563 | 0.968 | 1.039 | -1.704 |
| 1564 | 0.272 | 1.046 | -1.715 |
| 1565 | 2.467 | 1.043 | -1.711 |
| 1566 | 2.237 | 1.082 | -1.774 |
| 1567 | -0.231 | 1.111 | -1.822 |
| 1568 | 1.171 | 1.097 | -1.799 |
| 1569 | 2.15 | 1.101 | -1.805 |
| 1570 | 1.81 | 1.127 | -1.848 |
| 1571 | -3.565 | 1.141 | -1.871 |
| 1572 | 0.826 | 1.232 | -2.02 |
| 1573 | 1.991 | 1.224 | -2.008 |
| 1574 | -0.015 | 1.233 | -2.023 |
| 1575 | 0.447 | 1.231 | -2.018 |
| 1576 | 1.526 | 1.231 | -2.019 |
| 1577 | -0.479 | 1.24 | -2.034 |
| 1578 | 0.171 | 1.238 | -2.03 |
| 1579 | 0.645 | 1.223 | -2.006 |
| 1580 | -1.067 | 1.21 | -1.985 |
| 1581 | 0.249 | 1.201 | -1.97 |
| 1582 | 1.408 | 1.176 | -1.928 |
| 1583 | 0.572 | 1.183 | -1.94 |
| 1584 | 1.673 | 1.16 | -1.903 |
| 1585 | 0.413 | 1.162 | -1.906 |
| 1586 | 1.542 | 1.146 | -1.88 |
| 1587 | -0.537 | 1.15 | -1.885 |
| 1588 | 0.16 | 1.114 | -1.827 |
| 1589 | -0.438 | 1.101 | -1.806 |
| 1590 | -0.585 | 1.073 | -1.759 |
| 1591 | 0.273 | 1.068 | -1.751 |
| 1592 | 2.03 | 1.064 | -1.744 |
| 1593 | -0.346 | 1.079 | -1.77 |
| 1594 | 3.396 | 1.083 | -1.776 |
| 1595 | 1.117 | 1.141 | -1.871 |
| 1596 | 0.055 | 1.144 | -1.876 |
| 1597 | 0.74 | 1.142 | -1.873 |
| 1598 | 0.203 | 1.14 | -1.87 |
| 1599 | -0.641 | 1.139 | -1.868 |
| 1600 | -0.88 | 1.148 | -1.882 |
| 1601 | 0.665 | 1.16 | -1.902 |
| 1602 | -0.282 | 1.158 | -1.899 |
| 1603 | -1.359 | 1.149 | -1.884 |
| 1604 | 0.887 | 1.149 | -1.885 |
| 1605 | -0.644 | 1.125 | -1.845 |
| 1606 | -0.847 | 1.122 | -1.84 |
| 1607 | 1.691 | 1.133 | -1.858 |
| 1608 | -0.446 | 1.141 | -1.871 |
| 1609 | -1.199 | 1.14 | -1.869 |
| 1610 | 2.482 | 1.144 | -1.875 |
| 1611 | -0.191 | 1.168 | -1.915 |
| 1612 | 1.173 | 1.159 | -1.901 |
| 1613 | 0.934 | 1.151 | -1.887 |
| 1614 | 0.137 | 1.151 | -1.888 |
| 1615 | 1.653 | 1.152 | -1.889 |
| 1616 | -0.871 | 1.161 | -1.904 |
| 1617 | -0.438 | 1.173 | -1.923 |
| 1618 | -2.021 | 1.178 | -1.932 |
| 1619 | 0.122 | 1.213 | -1.99 |
| 1620 | -0.02 | 1.205 | -1.976 |
| 1621 | -0.424 | 1.199 | -1.967 |
| 1622 | -0.534 | 1.201 | -1.969 |
| 1623 | 0.6 | 1.189 | -1.951 |
| 1624 | 0.225 | 1.188 | -1.948 |
| 1625 | -0.033 | 1.178 | -1.933 |
| 1626 | 0.389 | 1.177 | -1.931 |
| 1627 | 0.501 | 1.177 | -1.93 |
| 1628 | 1.132 | 1.166 | -1.912 |
| 1629 | 1.241 | 1.168 | -1.915 |
| 1630 | -0.064 | 1.171 | -1.92 |
| 1631 | 0.978 | 1.172 | -1.922 |
| 1632 | 0.645 | 1.145 | -1.878 |
| 1633 | -0.838 | 1.121 | -1.839 |
| 1634 | 0.155 | 1.128 | -1.851 |
| 1635 | 1.934 | 1.124 | -1.843 |
| 1636 | -0.441 | 1.118 | -1.834 |
| 1637 | -0.045 | 1.106 | -1.814 |
| 1638 | 0.092 | 0.998 | -1.636 |
| 1639 | -0.256 | 0.996 | -1.634 |
| 1640 | -0.49 | 0.976 | -1.601 |
| 1641 | -0.247 | 0.98 | -1.607 |
| 1642 | 1.605 | 0.982 | -1.61 |
| 1643 | 0.038 | 0.983 | -1.613 |
| 1644 | -0.667 | 0.98 | -1.606 |
| 1645 | 0.436 | 0.986 | -1.617 |
| 1646 | -2.235 | 0.985 | -1.616 |
| 1647 | -3.105 | 1.019 | -1.672 |
| 1648 | -0.981 | 1.099 | -1.803 |
| 1649 | -0.649 | 1.098 | -1.8 |
| 1650 | 0.085 | 1.101 | -1.805 |
| 1651 | 0.325 | 1.084 | -1.777 |
| 1652 | 0.111 | 1.083 | -1.776 |
| 1653 | 0.294 | 1.068 | -1.752 |
| 1654 | 1.15 | 1.066 | -1.748 |
| 1655 | 0.874 | 1.074 | -1.761 |
| 1656 | 1.96 | 1.075 | -1.764 |
| 1657 | 0.446 | 1.095 | -1.796 |
| 1658 | -1.397 | 1.095 | -1.796 |
| 1659 | -0.77 | 1.087 | -1.783 |
| 1660 | -0.404 | 1.091 | -1.789 |
| 1661 | -0.629 | 1.013 | -1.661 |
| 1662 | 1.191 | 1.007 | -1.652 |
| 1663 | 1.144 | 1.017 | -1.668 |
| 1664 | -0.575 | 1.023 | -1.677 |
| 1665 | -1.32 | 1.025 | -1.682 |
| 1666 | 0.259 | 1.036 | -1.699 |
| 1667 | -0.345 | 1.03 | -1.689 |
| 1668 | -1.066 | 1.028 | -1.686 |
| 1669 | 1.07 | 1.036 | -1.699 |
| 1670 | -0.089 | 1.03 | -1.689 |
| 1671 | 0.076 | 1.024 | -1.68 |
| 1672 | -0.697 | 1.021 | -1.674 |
| 1673 | 0.974 | 1.019 | -1.671 |
| 1674 | 0.971 | 1.005 | -1.648 |
| 1675 | -0.246 | 1.01 | -1.656 |
| 1676 | -0.076 | 0.998 | -1.637 |
| 1677 | 0.748 | 0.952 | -1.561 |
| 1678 | 0.624 | 0.955 | -1.567 |
| 1679 | -0.02 | 0.948 | -1.554 |
| 1680 | 0.507 | 0.941 | -1.544 |
| 1681 | -1.241 | 0.943 | -1.547 |
| 1682 | -0.914 | 0.934 | -1.532 |
| 1683 | -1.256 | 0.935 | -1.533 |
| 1684 | -0.571 | 0.946 | -1.551 |
| 1685 | 1.537 | 0.915 | -1.501 |
| 1686 | -0.197 | 0.934 | -1.532 |
| 1687 | 0.314 | 0.935 | -1.533 |
| 1688 | 0.855 | 0.934 | -1.531 |
| 1689 | -1.413 | 0.936 | -1.535 |
| 1690 | -1.633 | 0.951 | -1.559 |
| 1691 | 0.023 | 0.972 | -1.594 |
| 1692 | 1.629 | 0.972 | -1.594 |
| 1693 | -0.632 | 0.992 | -1.626 |
| 1694 | -0.938 | 0.993 | -1.628 |
| 1695 | 0.912 | 0.989 | -1.622 |
| 1696 | 2.013 | 0.983 | -1.613 |
| 1697 | 0.306 | 1.015 | -1.665 |
| 1698 | -0.068 | 1.009 | -1.654 |
| 1699 | 0.558 | 1.005 | -1.649 |
| 1700 | 0.123 | 1.003 | -1.644 |
| 1701 | -0.072 | 1.003 | -1.644 |
| 1702 | 0.733 | 0.973 | -1.595 |
| 1703 | 1.448 | 0.976 | -1.601 |
| 1704 | -0.032 | 0.993 | -1.628 |
| 1705 | 2.047 | 0.993 | -1.628 |
| 1706 | -0.457 | 1.023 | -1.678 |
| 1707 | -0.442 | 1.023 | -1.678 |
| 1708 | -1.874 | 1.024 | -1.68 |
| 1709 | -0.72 | 1.032 | -1.692 |
| 1710 | -0.714 | 1.035 | -1.698 |
| 1711 | 1.021 | 1.036 | -1.698 |
| 1712 | -0.22 | 1.042 | -1.709 |
| 1713 | 1.17 | 1.005 | -1.649 |
| 1714 | -0.551 | 0.937 | -1.537 |
| 1715 | 0.045 | 0.931 | -1.527 |
| 1716 | -1.894 | 0.926 | -1.519 |
| 1717 | 1.261 | 0.958 | -1.571 |
| 1718 | -0.718 | 0.969 | -1.589 |
| 1719 | 0.505 | 0.974 | -1.597 |
| 1720 | -0.338 | 0.975 | -1.599 |
| 1721 | 0.747 | 0.967 | -1.585 |
| 1722 | 1.759 | 0.965 | -1.583 |
| 1723 | 2.902 | 0.959 | -1.573 |
| 1724 | -0.353 | 1.021 | -1.674 |
| 1725 | -0.053 | 1.006 | -1.65 |
| 1726 | -0.07 | 1 | -1.64 |
| 1727 | -0.588 | 0.998 | -1.637 |
| 1728 | -1.304 | 0.998 | -1.637 |
| 1729 | -0.561 | 1.004 | -1.646 |
| 1730 | 0.32 | 0.997 | -1.636 |
| 1731 | 0.137 | 0.995 | -1.632 |
| 1732 | 1.371 | 0.98 | -1.607 |
| 1733 | -0.273 | 0.993 | -1.628 |
| 1734 | 0.206 | 0.992 | -1.627 |
| 1735 | 0.645 | 0.981 | -1.61 |
| 1736 | 0.147 | 0.977 | -1.601 |
| 1737 | 1.144 | 0.976 | -1.601 |
| 1738 | -0.145 | 0.984 | -1.614 |
| 1739 | -1.425 | 0.98 | -1.607 |
| 1740 | 1.905 | 0.993 | -1.628 |
| 1741 | -0.778 | 1.012 | -1.659 |
| 1742 | 0 | 1.017 | -1.667 |
| 1743 | 2.775 | 1.016 | -1.667 |
| 1744 | 1.174 | 1.065 | -1.747 |
| 1745 | 0.254 | 1.071 | -1.757 |
| 1746 | -0.068 | 1.071 | -1.757 |
| 1747 | -1.398 | 1.071 | -1.756 |
| 1748 | 0.166 | 1.074 | -1.761 |
| 1749 | -0.121 | 1.066 | -1.748 |
| 1750 | 1.365 | 1.052 | -1.725 |
| 1751 | 0.448 | 1.058 | -1.735 |
| 1752 | -0.395 | 1.045 | -1.714 |
| 1753 | -0.875 | 1.046 | -1.716 |
| 1754 | 0.722 | 1.054 | -1.729 |
| 1755 | -0.043 | 1.053 | -1.727 |
| 1756 | -0.123 | 1.035 | -1.697 |
| 1757 | -0.884 | 1.01 | -1.657 |
| 1758 | -0.449 | 1.019 | -1.671 |
| 1759 | 0.211 | 1.006 | -1.65 |
| 1760 | -1.053 | 1.001 | -1.642 |
| 1761 | 0.336 | 1.003 | -1.645 |
| 1762 | 0.287 | 0.999 | -1.639 |
| 1763 | -0.331 | 0.972 | -1.595 |
| 1764 | 1.577 | 0.974 | -1.597 |
| 1765 | -0.179 | 0.99 | -1.623 |
| 1766 | -0.044 | 0.989 | -1.622 |
| 1767 | 0.381 | 0.99 | -1.623 |
| 1768 | -0.559 | 0.99 | -1.623 |
| 1769 | -0.034 | 0.991 | -1.625 |
| 1770 | 1.476 | 0.977 | -1.602 |
| 1771 | 1.769 | 0.991 | -1.626 |
| 1772 | -0.382 | 0.983 | -1.613 |
| 1773 | -0.127 | 0.983 | -1.612 |
| 1774 | -1.424 | 0.981 | -1.609 |
| 1775 | 0.007 | 0.968 | -1.588 |
| 1776 | 0.297 | 0.962 | -1.578 |
| 1777 | -0.018 | 0.956 | -1.569 |
| 1778 | 0.447 | 0.951 | -1.559 |
| 1779 | 0.116 | 0.95 | -1.558 |
| 1780 | 0.902 | 0.942 | -1.544 |
| 1781 | 0.04 | 0.942 | -1.545 |
| 1782 | -0.901 | 0.942 | -1.545 |
| 1783 | -0.464 | 0.917 | -1.503 |
| 1784 | 0.317 | 0.91 | -1.492 |
| 1785 | -0.196 | 0.903 | -1.482 |
| 1786 | 0.162 | 0.904 | -1.482 |
| 1787 | -0.658 | 0.901 | -1.478 |
| 1788 | 1.664 | 0.904 | -1.483 |
| 1789 | 0.019 | 0.901 | -1.478 |
| 1790 | -2.106 | 0.833 | -1.366 |
| 1791 | -0.644 | 0.874 | -1.434 |
| 1792 | 0.685 | 0.879 | -1.441 |
| 1793 | 0.399 | 0.882 | -1.446 |
| 1794 | 1.413 | 0.879 | -1.441 |
| 1795 | 1.17 | 0.876 | -1.437 |
| 1796 | -0.514 | 0.881 | -1.445 |
| 1797 | 0.267 | 0.885 | -1.451 |
| 1798 | 1.076 | 0.885 | -1.451 |
| 1799 | 1.217 | 0.879 | -1.442 |
| 1800 | -0.129 | 0.888 | -1.456 |
| 1801 | 1.216 | 0.888 | -1.457 |
| 1802 | 0.712 | 0.896 | -1.469 |
| 1803 | -0.271 | 0.898 | -1.473 |
| 1804 | -0.227 | 0.892 | -1.462 |
| 1805 | -0.368 | 0.892 | -1.463 |
| 1806 | 0.634 | 0.873 | -1.431 |
| 1807 | -0.278 | 0.848 | -1.39 |
| 1808 | -0.809 | 0.841 | -1.38 |
| 1809 | 0.314 | 0.849 | -1.393 |
| 1810 | 0.175 | 0.784 | -1.285 |
| 1811 | -1.347 | 0.772 | -1.267 |
| 1812 | -0.719 | 0.792 | -1.299 |
| 1813 | 0.361 | 0.798 | -1.309 |
| 1814 | -0.436 | 0.778 | -1.275 |
| 1815 | -0.106 | 0.78 | -1.28 |
| 1816 | 2.361 | 0.78 | -1.28 |
| 1817 | 1.862 | 0.814 | -1.336 |
| 1818 | 0.025 | 0.842 | -1.381 |
| 1819 | -1.122 | 0.84 | -1.377 |
| 1820 | -0.451 | 0.845 | -1.385 |
| 1821 | -1.661 | 0.844 | -1.384 |
| 1822 | -1.124 | 0.871 | -1.429 |
| 1823 | -0.661 | 0.883 | -1.449 |
| 1824 | -2.306 | 0.88 | -1.444 |
| 1825 | 1.058 | 0.925 | -1.518 |
| 1826 | 0.863 | 0.934 | -1.531 |
| 1827 | 0.954 | 0.929 | -1.523 |
| 1828 | 0.571 | 0.934 | -1.532 |
| 1829 | 0.388 | 0.936 | -1.535 |
| 1830 | 0.487 | 0.935 | -1.534 |
| 1831 | -1.938 | 0.918 | -1.506 |
| 1832 | -0.53 | 0.951 | -1.56 |
| 1833 | -0.325 | 0.954 | -1.564 |
| 1834 | -1.308 | 0.954 | -1.564 |
| 1835 | -1.164 | 0.965 | -1.583 |
| 1836 | -2.054 | 0.976 | -1.601 |
| 1837 | -1.581 | 0.992 | -1.626 |
| 1838 | -0.05 | 0.983 | -1.612 |
| 1839 | 1.156 | 0.982 | -1.611 |
| 1840 | -2.604 | 0.994 | -1.631 |
| 1841 | 0.545 | 1.029 | -1.688 |
| 1842 | 0.294 | 1.032 | -1.692 |
| 1843 | 0.893 | 1.032 | -1.692 |
| 1844 | -0.402 | 1.039 | -1.704 |
| 1845 | -2.276 | 1.038 | -1.702 |
| 1846 | 0.511 | 1.072 | -1.758 |
| 1847 | -1.712 | 1.067 | -1.75 |
| 1848 | 0.473 | 1.085 | -1.779 |
| 1849 | 0.678 | 1.083 | -1.777 |
| 1850 | 1.136 | 1.087 | -1.783 |
| 1851 | 1.579 | 1.097 | -1.798 |
| 1852 | 1.339 | 1.116 | -1.83 |
| 1853 | 0.782 | 1.129 | -1.851 |
| 1854 | 0.17 | 1.131 | -1.854 |
| 1855 | 0.476 | 1.111 | -1.822 |
| 1856 | -0.854 | 1.113 | -1.825 |
| 1857 | 2.557 | 1.088 | -1.784 |
| 1858 | 1.586 | 1.13 | -1.854 |
| 1859 | 0.122 | 1.144 | -1.876 |
| 1860 | 0.04 | 1.143 | -1.874 |
| 1861 | 0.448 | 1.13 | -1.853 |
| 1862 | 0.179 | 1.122 | -1.84 |
| 1863 | -0.551 | 1.12 | -1.837 |
| 1864 | 1.802 | 1.122 | -1.84 |
| 1865 | 0.315 | 1.136 | -1.863 |
| 1866 | 0.754 | 1.127 | -1.848 |
| 1867 | 0.384 | 1.13 | -1.854 |
| 1868 | -1.39 | 1.121 | -1.839 |
| 1869 | 0.419 | 1.131 | -1.854 |
| 1870 | 2.512 | 1.132 | -1.856 |
| 1871 | 1.076 | 1.173 | -1.924 |
| 1872 | -0.563 | 1.18 | -1.935 |
| 1873 | 1.121 | 1.18 | -1.934 |
| 1874 | 1.06 | 1.187 | -1.946 |
| 1875 | 0.538 | 1.188 | -1.949 |
| 1876 | 0.445 | 1.189 | -1.951 |
| 1877 | 1.083 | 1.19 | -1.952 |
| 1878 | -0.487 | 1.183 | -1.94 |
| 1879 | 0.476 | 1.181 | -1.937 |
| 1880 | 0.873 | 1.181 | -1.937 |
| 1881 | -0.431 | 1.183 | -1.94 |
| 1882 | -1.173 | 1.185 | -1.943 |
| 1883 | -0.221 | 1.162 | -1.906 |
| 1884 | -1.663 | 1.141 | -1.871 |
| 1885 | 0.866 | 1.16 | -1.903 |
| 1886 | 0.013 | 1.156 | -1.896 |
| 1887 | 0.61 | 1.154 | -1.893 |
| 1888 | 0.208 | 1.136 | -1.863 |
| 1889 | 1.51 | 1.126 | -1.846 |
| 1890 | -0.807 | 1.134 | -1.86 |
| 1891 | -1.321 | 1.099 | -1.802 |
| 1892 | 1.572 | 1.108 | -1.817 |
| 1893 | -0.296 | 1.119 | -1.835 |
| 1894 | 0.209 | 1.115 | -1.829 |
| 1895 | -0.873 | 1.114 | -1.827 |
| 1896 | -0.651 | 1.12 | -1.837 |
| 1897 | -1.58 | 1.123 | -1.842 |
| 1898 | 0.899 | 1.114 | -1.827 |
| 1899 | -0.645 | 1.116 | -1.83 |
| 1900 | 1.322 | 1.118 | -1.834 |
| 1901 | 0.548 | 1.114 | -1.827 |
| 1902 | -0.223 | 1.103 | -1.809 |
| 1903 | -0.003 | 1.068 | -1.752 |
| 1904 | 0.456 | 1.045 | -1.714 |
| 1905 | 0.71 | 1.045 | -1.714 |
| 1906 | -1.292 | 1.04 | -1.706 |
| 1907 | -0.645 | 0.997 | -1.636 |
| 1908 | -1.186 | 1.003 | -1.644 |
| 1909 | -0.635 | 1.017 | -1.669 |
| 1910 | -0.138 | 1.019 | -1.671 |
| 1911 | 0.218 | 1.017 | -1.668 |
| 1912 | 0.456 | 0.969 | -1.59 |
| 1913 | 1.769 | 0.969 | -1.59 |
| 1914 | -0.136 | 0.957 | -1.569 |
| 1915 | 0.001 | 0.958 | -1.571 |
| 1916 | -0.843 | 0.957 | -1.57 |
| 1917 | -1.559 | 0.96 | -1.575 |
| 1918 | -0.497 | 0.97 | -1.59 |
| 1919 | 0.102 | 0.962 | -1.578 |
| 1920 | 0.697 | 0.959 | -1.573 |
| 1921 | 0.567 | 0.961 | -1.577 |
| 1922 | -0.826 | 0.962 | -1.578 |
| 1923 | 0.207 | 0.962 | -1.577 |
| 1924 | 0.104 | 0.913 | -1.498 |
| 1925 | -0.27 | 0.895 | -1.467 |
| 1926 | -0.559 | 0.896 | -1.469 |
| 1927 | -0.418 | 0.899 | -1.475 |
| 1928 | 1.242 | 0.9 | -1.476 |
| 1929 | 1.85 | 0.912 | -1.495 |
| 1930 | -1.674 | 0.934 | -1.531 |
| 1931 | -0.069 | 0.935 | -1.534 |
| 1932 | 0.58 | 0.935 | -1.533 |
| 1933 | -0.173 | 0.933 | -1.53 |
| 1934 | -0.492 | 0.932 | -1.529 |
| 1935 | 1.076 | 0.918 | -1.505 |
| 1936 | -0.53 | 0.925 | -1.517 |
| 1937 | 0.172 | 0.876 | -1.437 |
| 1938 | -0.921 | 0.866 | -1.421 |
| 1939 | -0.683 | 0.871 | -1.429 |
| 1940 | -0.406 | 0.864 | -1.417 |
| 1941 | -0.71 | 0.854 | -1.401 |
| 1942 | -0.369 | 0.855 | -1.402 |
| 1943 | -1.405 | 0.854 | -1.4 |
| 1944 | -0.085 | 0.856 | -1.405 |
| 1945 | 0.084 | 0.855 | -1.403 |
| 1946 | 1.011 | 0.852 | -1.398 |
| 1947 | -1.412 | 0.855 | -1.402 |
| 1948 | -0.164 | 0.869 | -1.425 |
| 1949 | 1.616 | 0.859 | -1.409 |
| 1950 | -0.851 | 0.885 | -1.451 |
| 1951 | 0.677 | 0.868 | -1.424 |
| 1952 | -0.088 | 0.865 | -1.419 |
| 1953 | -0.204 | 0.865 | -1.419 |
| 1954 | 0.924 | 0.861 | -1.412 |
| 1955 | -2.521 | 0.869 | -1.426 |
| 1956 | 0.271 | 0.897 | -1.472 |
| 1957 | -0.279 | 0.895 | -1.467 |
| 1958 | -1.552 | 0.882 | -1.447 |
| 1959 | 0.558 | 0.875 | -1.435 |
| 1960 | 1.536 | 0.879 | -1.441 |
| 1961 | -0.701 | 0.902 | -1.479 |
| 1962 | 0.429 | 0.9 | -1.476 |
| 1963 | -1.108 | 0.9 | -1.476 |
| 1964 | -0.403 | 0.89 | -1.459 |
| 1965 | 0.179 | 0.882 | -1.446 |
| 1966 | -0.517 | 0.88 | -1.443 |
| 1967 | 1.118 | 0.863 | -1.416 |
| 1968 | -2.098 | 0.873 | -1.432 |
| 1969 | 2.308 | 0.906 | -1.486 |
| 1970 | -1.091 | 0.955 | -1.567 |
| 1971 | 1.1 | 0.96 | -1.574 |
| 1972 | -0.932 | 0.966 | -1.585 |
| 1973 | -0.065 | 0.961 | -1.576 |
| 1974 | -0.378 | 0.959 | -1.572 |
| 1975 | -1.162 | 0.95 | -1.558 |
| 1976 | 1.467 | 0.957 | -1.569 |
| 1977 | -0.198 | 0.976 | -1.601 |
| 1978 | -2.488 | 0.976 | -1.6 |
| 1979 | -1.83 | 1.016 | -1.667 |
| 1980 | 0.423 | 1.009 | -1.655 |
| 1981 | -0.287 | 1.012 | -1.659 |
| 1982 | -0.184 | 1.012 | -1.659 |
| 1983 | -0.976 | 1.008 | -1.654 |
| 1984 | -2.989 | 0.999 | -1.638 |
| 1985 | -0.296 | 1.057 | -1.733 |
| 1986 | -0.459 | 1.056 | -1.732 |
| 1987 | -0.079 | 1.05 | -1.722 |
| 1988 | -0.313 | 1.046 | -1.715 |
| 1989 | -1.433 | 1.043 | -1.711 |
| 1990 | -0.849 | 1.052 | -1.725 |
| 1991 | -0.088 | 1.053 | -1.727 |
| 1992 | 0.815 | 1.054 | -1.728 |
| 1993 | 0.246 | 1.061 | -1.741 |
| 1994 | -0.455 | 1.063 | -1.743 |
| 1995 | 0.197 | 1.047 | -1.717 |
| 1996 | 0.177 | 1.015 | -1.664 |
| 1997 | 0.186 | 1.001 | -1.642 |
| 1998 | 0.673 | 1.003 | -1.644 |
| 1999 | -0.657 | 1.004 | -1.646 |
| 2000 | -2.299 | 1.005 | -1.648 |
| 2001 | -0.245 | 1.035 | -1.698 |
| 2002 | -0.582 | 1.021 | -1.675 |
| 2003 | -0.241 | 1.021 | -1.675 |
| 2004 | 0.427 | 1.02 | -1.672 |
| 2005 | -0.845 | 1.021 | -1.674 |
| 2006 | 0.929 | 1.022 | -1.676 |
| 2007 | 1.659 | 1.033 | -1.694 |
| 2008 | 1.08 | 1.059 | -1.737 |
| 2009 | -0.069 | 1.071 | -1.757 |
| 2010 | -0.462 | 1.061 | -1.74 |
| 2011 | 1.494 | 1.061 | -1.741 |
| 2012 | -0.732 | 1.081 | -1.774 |
| 2013 | -0.281 | 1.073 | -1.76 |
| 2014 | -1.027 | 1.063 | -1.743 |
| 2015 | -2.484 | 1.067 | -1.751 |
| 2016 | -0.477 | 1.079 | -1.769 |
| 2017 | 0.066 | 1.077 | -1.766 |
| 2018 | 2.12 | 1.071 | -1.757 |
| 2019 | -0.983 | 1.111 | -1.822 |
| 2020 | -1.371 | 1.114 | -1.828 |
| 2021 | 0.363 | 1.113 | -1.825 |
| 2022 | 0.305 | 1.08 | -1.771 |
| 2023 | 0.284 | 1.08 | -1.772 |
| 2024 | 2.558 | 1.082 | -1.775 |
| 2025 | -0.934 | 1.123 | -1.841 |
| 2026 | -0.174 | 1.123 | -1.842 |
| 2027 | -0.226 | 1.102 | -1.807 |
| 2028 | 0.029 | 1.1 | -1.804 |
| 2029 | 0.394 | 1.098 | -1.8 |
| 2030 | 0.46 | 1.095 | -1.795 |
| 2031 | -0.082 | 1.097 | -1.8 |
| 2032 | -0.529 | 1.096 | -1.798 |
| 2033 | -0.47 | 1.096 | -1.798 |
| 2034 | -0.704 | 1.085 | -1.779 |
| 2035 | 1.126 | 1.061 | -1.74 |
| 2036 | 0.021 | 1.027 | -1.685 |
| 2037 | -0.54 | 1.022 | -1.676 |
| 2038 | -1.178 | 1.01 | -1.656 |
| 2039 | -0.332 | 1.013 | -1.661 |
| 2040 | 0.153 | 1.013 | -1.661 |
| 2041 | 0.503 | 1.014 | -1.662 |
| 2042 | 0.2 | 1.01 | -1.657 |
| 2043 | -0.449 | 0.99 | -1.624 |
| 2044 | -2.567 | 0.991 | -1.625 |
| 2045 | 0.467 | 0.994 | -1.629 |
| 2046 | -1.348 | 0.976 | -1.601 |
| 2047 | 1.021 | 0.984 | -1.613 |
| 2048 | 0.791 | 0.995 | -1.632 |
| 2049 | -0.362 | 1.002 | -1.644 |
| 2050 | 0.539 | 0.998 | -1.636 |
| 2051 | 0.805 | 0.937 | -1.536 |
| 2052 | -0.715 | 0.943 | -1.547 |
| 2053 | 3.007 | 0.945 | -1.55 |
| 2054 | 1.171 | 1.02 | -1.672 |
| 2055 | -0.238 | 1.03 | -1.689 |
| 2056 | 0.331 | 1.015 | -1.665 |
| 2057 | 1.22 | 1.011 | -1.658 |
| 2058 | -0.56 | 1.022 | -1.676 |
| 2059 | 0.172 | 1.019 | -1.672 |
| 2060 | -0.129 | 1.019 | -1.671 |
| 2061 | -0.2 | 1.018 | -1.669 |
| 2062 | 0.091 | 1.018 | -1.669 |
| 2063 | 0.438 | 1.018 | -1.669 |
| 2064 | -1.959 | 1.019 | -1.671 |
| 2065 | 0.912 | 1.043 | -1.711 |
| 2066 | 1.461 | 1.047 | -1.717 |
| 2067 | 0.037 | 1.022 | -1.677 |
| 2068 | -1.747 | 1.022 | -1.676 |
| 2069 | -0.224 | 1.043 | -1.71 |
| 2070 | -0.003 | 1.043 | -1.71 |
| 2071 | 0.173 | 1.041 | -1.708 |
| 2072 | 0.813 | 1.036 | -1.699 |
| 2073 | -0.371 | 1.034 | -1.697 |
| 2074 | 0.305 | 1.016 | -1.666 |
| 2075 | -0.527 | 1.008 | -1.652 |
| 2076 | -0.627 | 1.01 | -1.656 |
| 2077 | 0.305 | 1.011 | -1.658 |
| 2078 | -1.238 | 0.994 | -1.63 |
| 2079 | -0.649 | 1.002 | -1.643 |
| 2080 | -0.01 | 1.004 | -1.647 |
| 2081 | -0.569 | 0.996 | -1.634 |
| 2082 | -0.985 | 0.951 | -1.559 |
| 2083 | -0.373 | 0.957 | -1.569 |
| 2084 | 0.709 | 0.958 | -1.57 |
| 2085 | 1.617 | 0.924 | -1.516 |
| 2086 | 0.144 | 0.939 | -1.539 |
| 2087 | -0.536 | 0.923 | -1.513 |
| 2088 | 0.34 | 0.924 | -1.516 |
| 2089 | -1.295 | 0.925 | -1.516 |
| 2090 | 0.871 | 0.938 | -1.538 |
| 2091 | 1.164 | 0.889 | -1.457 |
| 2092 | 1.112 | 0.893 | -1.465 |
| 2093 | -0.335 | 0.904 | -1.482 |
| 2094 | -1.003 | 0.904 | -1.483 |
| 2095 | -0.013 | 0.913 | -1.497 |
| 2096 | -1.222 | 0.911 | -1.495 |
| 2097 | -1.213 | 0.922 | -1.512 |
| 2098 | 0.671 | 0.933 | -1.53 |
| 2099 | -1.743 | 0.935 | -1.534 |
| 2100 | 0.189 | 0.957 | -1.57 |
| 2101 | 0.559 | 0.954 | -1.565 |
| 2102 | 2.528 | 0.946 | -1.552 |
| 2103 | 0.912 | 0.998 | -1.636 |
| 2104 | -0.549 | 1.002 | -1.643 |
| 2105 | -1.069 | 0.993 | -1.629 |
| 2106 | -1.459 | 1.001 | -1.642 |
| 2107 | -0.426 | 1.017 | -1.669 |
| 2108 | -0.543 | 1.017 | -1.667 |
| 2109 | 0.059 | 1.018 | -1.67 |
| 2110 | 0.298 | 1.017 | -1.668 |
| 2111 | -0.87 | 0.967 | -1.586 |
| 2112 | -1.03 | 0.971 | -1.593 |
| 2113 | -1.52 | 0.965 | -1.583 |
| 2114 | -1.25 | 0.975 | -1.598 |
| 2115 | -1.136 | 0.98 | -1.607 |
| 2116 | 2.155 | 0.988 | -1.621 |
| 2117 | 0.186 | 1.023 | -1.678 |
| 2118 | -1.487 | 1.018 | -1.67 |
| 2119 | 0.14 | 1.03 | -1.689 |
| 2120 | -0.576 | 0.956 | -1.567 |
| 2121 | 0.022 | 0.943 | -1.547 |
| 2122 | 0.544 | 0.944 | -1.548 |
| 2123 | 0.46 | 0.946 | -1.551 |
| 2124 | -1.294 | 0.933 | -1.531 |
| 2125 | 0.777 | 0.943 | -1.546 |
| 2126 | 0.634 | 0.949 | -1.556 |
| 2127 | 0.542 | 0.954 | -1.564 |
| 2128 | 0.599 | 0.958 | -1.57 |
| 2129 | 1.191 | 0.961 | -1.577 |
| 2130 | -0.842 | 0.973 | -1.595 |
| 2131 | -1.071 | 0.949 | -1.557 |
| 2132 | -0.114 | 0.948 | -1.555 |
| 2133 | -0.005 | 0.927 | -1.521 |
| 2134 | 0.091 | 0.927 | -1.521 |
| 2135 | 1.568 | 0.906 | -1.486 |
| 2136 | 0.229 | 0.929 | -1.524 |
| 2137 | -0.414 | 0.93 | -1.526 |
| 2138 | -0.696 | 0.93 | -1.526 |
| 2139 | 0.195 | 0.926 | -1.519 |
| 2140 | -1.438 | 0.926 | -1.519 |
| 2141 | -1.14 | 0.939 | -1.54 |
| 2142 | -1.6 | 0.946 | -1.551 |
| 2143 | 2.699 | 0.961 | -1.576 |
| 2144 | 0.921 | 1.022 | -1.676 |
| 2145 | 0.122 | 1.021 | -1.674 |
| 2146 | 1.366 | 1.019 | -1.671 |
| 2147 | 0.261 | 1.034 | -1.696 |
| 2148 | 0.569 | 1.033 | -1.694 |
| 2149 | -0.06 | 1.029 | -1.688 |
| 2150 | -0.573 | 1.028 | -1.686 |
| 2151 | 1.261 | 1.026 | -1.683 |
| 2152 | 1.715 | 1.018 | -1.67 |
| 2153 | 0.1 | 1.041 | -1.707 |
| 2154 | -0.783 | 1.039 | -1.704 |
| 2155 | -0.135 | 1.042 | -1.71 |
| 2156 | -0.236 | 1.03 | -1.69 |
| 2157 | 0.73 | 1.025 | -1.681 |
| 2158 | -1.119 | 1.018 | -1.67 |
| 2159 | -1.172 | 1.017 | -1.667 |
| 2160 | 0.336 | 1.025 | -1.681 |
| 2161 | -0.779 | 1.02 | -1.673 |
| 2162 | -0.097 | 1.024 | -1.679 |
| 2163 | -0.567 | 1.014 | -1.663 |
| 2164 | 0.515 | 1.005 | -1.649 |
| 2165 | 0.175 | 1.004 | -1.646 |
| 2166 | -0.594 | 0.982 | -1.61 |
| 2167 | 0.453 | 0.984 | -1.614 |
| 2168 | 0.916 | 0.983 | -1.612 |
| 2169 | -0.659 | 0.937 | -1.537 |
| 2170 | 0.472 | 0.932 | -1.529 |
| 2171 | -2.296 | 0.933 | -1.53 |
| 2172 | -0.773 | 0.965 | -1.582 |
| 2173 | 0.113 | 0.953 | -1.563 |
| 2174 | 0.242 | 0.953 | -1.562 |
| 2175 | -1.685 | 0.951 | -1.56 |
| 2176 | -1.635 | 0.972 | -1.594 |
| 2177 | 1.032 | 0.99 | -1.623 |
| 2178 | 0.971 | 0.995 | -1.632 |
| 2179 | 0.467 | 0.996 | -1.633 |
| 2180 | 1.799 | 0.981 | -1.609 |
| 2181 | 1.355 | 0.994 | -1.63 |
| 2182 | -1.336 | 0.996 | -1.634 |
| 2183 | -1.88 | 0.976 | -1.601 |
| 2184 | -1.902 | 1.003 | -1.645 |
| 2185 | -0.378 | 1.014 | -1.662 |
| 2186 | 0.45 | 1.014 | -1.663 |
| 2187 | 0.255 | 1.014 | -1.663 |
| 2188 | -0.262 | 1.014 | -1.663 |
| 2189 | 0.119 | 1.012 | -1.66 |
| 2190 | 0.773 | 1.011 | -1.657 |
| 2191 | 0.75 | 1.003 | -1.645 |
| 2192 | 0.376 | 1.003 | -1.644 |
| 2193 | -2.306 | 1.001 | -1.641 |
| 2194 | 1.192 | 1.037 | -1.701 |
| 2195 | -0.519 | 1.046 | -1.715 |
| 2196 | 0.278 | 1.036 | -1.699 |
| 2197 | 1.572 | 1.032 | -1.692 |
| 2198 | 0.991 | 1.043 | -1.71 |
| 2199 | 0.378 | 1.05 | -1.722 |
| 2200 | -0.116 | 1.051 | -1.724 |
| 2201 | 0.496 | 1.051 | -1.724 |
| 2202 | 0.697 | 1.035 | -1.697 |
| 2203 | 0.429 | 1.038 | -1.703 |
| 2204 | -1.755 | 1.038 | -1.703 |
| 2205 | -0.249 | 1.057 | -1.734 |
| 2206 | 0.435 | 1.057 | -1.734 |
| 2207 | 0.311 | 1.044 | -1.711 |
| 2208 | -0.108 | 1.034 | -1.696 |
| 2209 | -0.247 | 1.014 | -1.663 |
| 2210 | -0.295 | 0.959 | -1.573 |
| 2211 | -0.443 | 0.953 | -1.563 |
| 2212 | 0.637 | 0.955 | -1.566 |
| 2213 | -0.744 | 0.943 | -1.546 |
| 2214 | 1.051 | 0.946 | -1.552 |
| 2215 | 0.221 | 0.953 | -1.563 |
| 2216 | 2.17 | 0.953 | -1.563 |
| 2217 | -0.189 | 0.988 | -1.62 |
| 2218 | -1.175 | 0.976 | -1.601 |
| 2219 | -1.133 | 0.962 | -1.578 |
| 2220 | -1.199 | 0.972 | -1.593 |
| 2221 | -0.876 | 0.978 | -1.603 |
| 2222 | 1.944 | 0.983 | -1.611 |
| 2223 | -1.073 | 1.014 | -1.662 |
| 2224 | -1.464 | 1.016 | -1.667 |
| 2225 | -0.938 | 1.023 | -1.677 |
| 2226 | -0.287 | 1.019 | -1.672 |
| 2227 | 1.561 | 1.018 | -1.67 |
| 2228 | 1.625 | 1.035 | -1.697 |
| 2229 | 0.857 | 1.055 | -1.73 |
| 2230 | 0.503 | 1.058 | -1.736 |
| 2231 | -2.02 | 1.058 | -1.735 |
| 2232 | 0.568 | 1.087 | -1.782 |
| 2233 | -0.761 | 1.087 | -1.782 |
| 2234 | -0.91 | 1.089 | -1.786 |
| 2235 | 0.381 | 1.087 | -1.783 |
| 2236 | 0.372 | 1.086 | -1.781 |
| 2237 | -1.266 | 1.086 | -1.78 |
| 2238 | 0.389 | 1.06 | -1.738 |
| 2239 | -0.112 | 1.057 | -1.734 |
| 2240 | -0.151 | 1.057 | -1.734 |
| 2241 | -0.336 | 1.057 | -1.733 |
| 2242 | -0.654 | 1.037 | -1.701 |
| 2243 | 0.622 | 1.02 | -1.673 |
| 2244 | -1.328 | 1.015 | -1.665 |
| 2245 | -0.781 | 1.021 | -1.674 |
| 2246 | 0.463 | 1.023 | -1.678 |
| 2247 | -2.435 | 0.999 | -1.638 |
| 2248 | 1.629 | 1.024 | -1.679 |
| 2249 | -0.654 | 1.035 | -1.698 |
| 2250 | -1.703 | 1.013 | -1.662 |
| 2251 | -0.075 | 1.008 | -1.653 |
| 2252 | -0.375 | 1.007 | -1.652 |
| 2253 | 0.657 | 1.006 | -1.65 |
| 2254 | 1.148 | 1.009 | -1.655 |
| 2255 | -0.699 | 1.02 | -1.672 |
| 2256 | 0.411 | 1.023 | -1.677 |
| 2257 | -1.387 | 1.019 | -1.671 |
| 2258 | -0.028 | 1.027 | -1.684 |
| 2259 | 0.277 | 1.025 | -1.681 |
| 2260 | 0.133 | 0.988 | -1.621 |
| 2261 | -1.935 | 0.976 | -1.601 |
| 2262 | 1.084 | 1.001 | -1.642 |
| 2263 | 1.276 | 1.011 | -1.658 |
| 2264 | -0.586 | 1.004 | -1.646 |
| 2265 | -0.669 | 0.996 | -1.634 |
| 2266 | -1.261 | 0.997 | -1.635 |
| 2267 | -0.076 | 1.006 | -1.65 |
| 2268 | -0.984 | 1.003 | -1.645 |
| 2269 | -0.515 | 1.002 | -1.644 |
| 2270 | -1.417 | 1 | -1.64 |
| 2271 | 0.243 | 0.993 | -1.629 |
| 2272 | 0.109 | 0.994 | -1.631 |
| 2273 | 1.654 | 0.992 | -1.627 |
| 2274 | -0.973 | 1.016 | -1.666 |
| 2275 | -1.05 | 1.021 | -1.674 |
| 2276 | -0.416 | 1.026 | -1.683 |
| 2277 | -0.872 | 1.027 | -1.684 |
| 2278 | -1.645 | 1.03 | -1.689 |
| 2279 | 1.396 | 1.039 | -1.704 |
| 2280 | -0.616 | 1.056 | -1.732 |
| 2281 | -1.451 | 1.046 | -1.715 |
| 2282 | -0.529 | 1.055 | -1.73 |
| 2283 | -1.082 | 1.011 | -1.657 |
| 2284 | -0.05 | 1.015 | -1.665 |
| 2285 | 0.241 | 1.01 | -1.656 |
| 2286 | -0.574 | 1.006 | -1.651 |
| 2287 | 0.691 | 1 | -1.641 |
| 2288 | -2.351 | 1.004 | -1.647 |
| 2289 | 0.164 | 1 | -1.64 |
| 2290 | 0.635 | 0.997 | -1.635 |
| 2291 | -0.006 | 0.992 | -1.627 |
| 2292 | 1.056 | 0.989 | -1.622 |
| 2293 | -0.017 | 1.002 | -1.643 |
| 2294 | 0.017 | 0.977 | -1.602 |
| 2295 | -0.404 | 0.949 | -1.557 |
| 2296 | -0.476 | 0.939 | -1.54 |
| 2297 | -0.025 | 0.934 | -1.532 |
| 2298 | 0.017 | 0.909 | -1.491 |
| 2299 | 0.813 | 0.904 | -1.483 |
| 2300 | -0.251 | 0.912 | -1.496 |
| 2301 | -0.262 | 0.908 | -1.49 |
| 2302 | 0.577 | 0.905 | -1.484 |
| 2303 | -0.039 | 0.907 | -1.488 |
| 2304 | -0.289 | 0.899 | -1.474 |
| 2305 | -1.913 | 0.896 | -1.469 |
| 2306 | 1.355 | 0.919 | -1.506 |
| 2307 | 0.055 | 0.94 | -1.542 |
| 2308 | -1.137 | 0.941 | -1.543 |
| 2309 | 0.326 | 0.946 | -1.551 |
| 2310 | -1.008 | 0.942 | -1.545 |
| 2311 | 0.62 | 0.938 | -1.538 |
| 2312 | 0.05 | 0.941 | -1.544 |
| 2313 | -0.207 | 0.938 | -1.538 |
| 2314 | 0.35 | 0.897 | -1.471 |
| 2315 | -0.26 | 0.87 | -1.427 |
| 2316 | 0.783 | 0.868 | -1.424 |
| 2317 | -0.857 | 0.857 | -1.405 |
| 2318 | -0.419 | 0.861 | -1.411 |
| 2319 | 0.811 | 0.861 | -1.412 |
| 2320 | -0.434 | 0.863 | -1.416 |
| 2321 | 0.376 | 0.847 | -1.39 |
| 2322 | -0.058 | 0.848 | -1.391 |
| 2323 | 1.523 | 0.845 | -1.386 |
| 2324 | 1.193 | 0.858 | -1.407 |
| 2325 | 0.817 | 0.874 | -1.434 |
| 2326 | -0.552 | 0.881 | -1.444 |
| 2327 | -0.328 | 0.881 | -1.446 |
| 2328 | 0.25 | 0.853 | -1.399 |
| 2329 | 0.213 | 0.841 | -1.379 |
| 2330 | -1.51 | 0.824 | -1.351 |
| 2331 | 0.52 | 0.839 | -1.376 |
| 2332 | -0.263 | 0.841 | -1.378 |
| 2333 | -0.214 | 0.829 | -1.36 |
| 2334 | -0.011 | 0.829 | -1.36 |
| 2335 | 0.321 | 0.822 | -1.348 |
| 2336 | 0.445 | 0.822 | -1.349 |
| 2337 | -0.355 | 0.808 | -1.326 |
| 2338 | 0.037 | 0.808 | -1.325 |
| 2339 | 1.619 | 0.808 | -1.325 |
| 2340 | 0.07 | 0.807 | -1.323 |
| 2341 | -0.343 | 0.799 | -1.311 |
| 2342 | 0.574 | 0.791 | -1.297 |
| 2343 | -0.004 | 0.793 | -1.301 |
| 2344 | 0.056 | 0.786 | -1.29 |
| 2345 | 0.468 | 0.76 | -1.247 |
| 2346 | 1.481 | 0.742 | -1.217 |
| 2347 | -0.234 | 0.761 | -1.248 |
| 2348 | 1.209 | 0.739 | -1.213 |
| 2349 | -0.497 | 0.75 | -1.23 |
| 2350 | 0.466 | 0.74 | -1.213 |
| 2351 | -0.029 | 0.741 | -1.216 |
| 2352 | 0.149 | 0.741 | -1.215 |
| 2353 | 0.382 | 0.737 | -1.208 |
| 2354 | -0.107 | 0.734 | -1.203 |
| 2355 | 1.534 | 0.669 | -1.097 |
| 2356 | -0.368 | 0.691 | -1.134 |
| 2357 | 0.064 | 0.691 | -1.133 |
| 2358 | -0.948 | 0.691 | -1.133 |
| 2359 | 1.503 | 0.693 | -1.137 |
| 2360 | 1.213 | 0.714 | -1.172 |
| 2361 | -0.32 | 0.727 | -1.192 |
| 2362 | -1.044 | 0.726 | -1.191 |
| 2363 | -0.976 | 0.737 | -1.208 |
| 2364 | -0.217 | 0.749 | -1.228 |
| 2365 | 0.229 | 0.75 | -1.23 |
| 2366 | -1.145 | 0.745 | -1.221 |
| 2367 | 0.501 | 0.759 | -1.245 |
| 2368 | -1.06 | 0.76 | -1.246 |
| 2369 | -0.146 | 0.77 | -1.263 |
| 2370 | 0.161 | 0.771 | -1.264 |
| 2371 | -0.878 | 0.769 | -1.262 |
| 2372 | -0.739 | 0.738 | -1.211 |
| 2373 | -0.057 | 0.728 | -1.194 |
| 2374 | -0.974 | 0.728 | -1.194 |
| 2375 | -0.903 | 0.724 | -1.188 |
| 2376 | 1.399 | 0.733 | -1.202 |
| 2377 | 0.125 | 0.74 | -1.213 |
| 2378 | -1.259 | 0.737 | -1.208 |
| 2379 | 1.688 | 0.755 | -1.237 |
| 2380 | 0.547 | 0.78 | -1.28 |
| 2381 | -0.315 | 0.782 | -1.282 |
| 2382 | 0.391 | 0.782 | -1.283 |
| 2383 | 0.418 | 0.778 | -1.276 |
| 2384 | -0.671 | 0.771 | -1.264 |
| 2385 | 1.394 | 0.774 | -1.269 |
| 2386 | 0.265 | 0.785 | -1.288 |
| 2387 | 1.019 | 0.783 | -1.284 |
| 2388 | 1.338 | 0.79 | -1.296 |
| 2389 | 1.913 | 0.804 | -1.319 |
| 2390 | 1.227 | 0.816 | -1.338 |
| 2391 | -0.327 | 0.816 | -1.339 |
| 2392 | -0.466 | 0.814 | -1.335 |
| 2393 | 0.241 | 0.813 | -1.333 |
| 2394 | -1.312 | 0.811 | -1.33 |
| 2395 | 1.32 | 0.83 | -1.362 |
| 2396 | 0.04 | 0.843 | -1.383 |
| 2397 | 1.823 | 0.818 | -1.342 |
| 2398 | -1.294 | 0.843 | -1.382 |
| 2399 | 0.375 | 0.86 | -1.411 |
| 2400 | -0.443 | 0.859 | -1.409 |
| 2401 | 0.61 | 0.862 | -1.414 |
| 2402 | -0.369 | 0.864 | -1.417 |
| 2403 | -2.59 | 0.866 | -1.42 |
| 2404 | 0.344 | 0.927 | -1.521 |
| 2405 | 0.53 | 0.928 | -1.521 |
| 2406 | -1.049 | 0.91 | -1.493 |
| 2407 | -1.172 | 0.921 | -1.511 |
| 2408 | -1.258 | 0.933 | -1.53 |
| 2409 | 1.467 | 0.945 | -1.55 |
| 2410 | -0.346 | 0.961 | -1.576 |
| 2411 | 0.023 | 0.962 | -1.578 |
| 2412 | -0.894 | 0.961 | -1.576 |
| 2413 | -0.416 | 0.951 | -1.56 |
| 2414 | -0.326 | 0.952 | -1.562 |
| 2415 | -0.939 | 0.941 | -1.544 |
| 2416 | 0.34 | 0.947 | -1.552 |
| 2417 | -1.451 | 0.946 | -1.551 |
| 2418 | 1.023 | 0.962 | -1.578 |
| 2419 | 0.689 | 0.971 | -1.592 |
| 2420 | 3.024 | 0.973 | -1.596 |
| 2421 | 0.016 | 1.043 | -1.71 |
| 2422 | 1.448 | 1.026 | -1.682 |
| 2423 | 1.624 | 1.04 | -1.705 |
| 2424 | 1.776 | 1.058 | -1.735 |
| 2425 | 2.213 | 1.071 | -1.756 |
| 2426 | -0.064 | 1.089 | -1.785 |
| 2427 | -0.3 | 1.08 | -1.771 |
| 2428 | 0.106 | 1.08 | -1.771 |
| 2429 | -0.003 | 1.071 | -1.756 |
| 2430 | 1.015 | 1.062 | -1.742 |
| 2431 | 0.328 | 1.067 | -1.75 |
| 2432 | -0.364 | 1.067 | -1.75 |
| 2433 | 0.25 | 1.057 | -1.733 |
| 2434 | -0.135 | 1.056 | -1.732 |
| 2435 | -0.911 | 1.046 | -1.715 |
| 2436 | 1.065 | 1.053 | -1.728 |
| 2437 | -1.01 | 1.059 | -1.737 |
| 2438 | -1.822 | 1.062 | -1.741 |
| 2439 | -0.361 | 1.084 | -1.778 |
| 2440 | 1.867 | 1.085 | -1.78 |
| 2441 | 1.685 | 1.097 | -1.798 |
| 2442 | 0.052 | 1.103 | -1.809 |
| 2443 | 0.322 | 1.094 | -1.794 |
| 2444 | -0.275 | 1.094 | -1.794 |
| 2445 | -0.798 | 1.08 | -1.771 |
| 2446 | -1.138 | 1.071 | -1.757 |
| 2447 | 0.276 | 1.083 | -1.776 |
| 2448 | 1.45 | 1.081 | -1.773 |
| 2449 | 0.938 | 1.092 | -1.791 |
| 2450 | 1.388 | 1.096 | -1.797 |
| 2451 | -1.335 | 1.1 | -1.804 |
| 2452 | -0.355 | 1.107 | -1.815 |
| 2453 | 1.505 | 1.109 | -1.818 |
| 2454 | 0.87 | 1.116 | -1.83 |
| 2455 | 1.379 | 1.11 | -1.821 |
| 2456 | -2.039 | 1.099 | -1.803 |
| 2457 | 0.44 | 1.124 | -1.843 |
| 2458 | -0.914 | 1.123 | -1.842 |
| 2459 | 0.824 | 1.128 | -1.85 |
| 2460 | -1.096 | 1.132 | -1.856 |
| 2461 | -0.287 | 1.128 | -1.849 |
| 2462 | -0.975 | 1.119 | -1.835 |
| 2463 | 0.094 | 1.127 | -1.848 |
| 2464 | -0.621 | 1.106 | -1.814 |
| 2465 | -0.573 | 1.096 | -1.798 |
| 2466 | 0.331 | 1.099 | -1.802 |
| 2467 | -1.392 | 1.097 | -1.799 |
| 2468 | 1.399 | 1.11 | -1.82 |
| 2469 | 1.64 | 1.121 | -1.838 |
| 2470 | 0.729 | 1.087 | -1.782 |
| 2471 | -0.846 | 1.089 | -1.786 |
| 2472 | -1.174 | 1.094 | -1.795 |
| 2473 | 1.051 | 1.097 | -1.799 |
| 2474 | 1.916 | 1.09 | -1.788 |
| 2475 | 0.333 | 1.097 | -1.799 |
| 2476 | 1.02 | 1.086 | -1.781 |
| 2477 | 1.451 | 1.089 | -1.785 |
| 2478 | -2.047 | 1.099 | -1.802 |
| 2479 | 0.245 | 1.126 | -1.847 |
| 2480 | -1.276 | 1.123 | -1.842 |
| 2481 | -0.251 | 1.136 | -1.864 |
| 2482 | 0.961 | 1.129 | -1.851 |
| 2483 | 0.687 | 1.132 | -1.857 |
| 2484 | -1.165 | 1.114 | -1.827 |
| 2485 | -0.524 | 1.124 | -1.843 |
| 2486 | 2.059 | 1.126 | -1.846 |
| 2487 | 2.148 | 1.095 | -1.795 |
| 2488 | 0.852 | 1.12 | -1.837 |
| 2489 | 0.122 | 1.113 | -1.825 |
| 2490 | -1.813 | 1.099 | -1.802 |
| 2491 | 0.485 | 1.108 | -1.817 |
| 2492 | 0.08 | 1.078 | -1.768 |
| 2493 | 0.224 | 1.078 | -1.768 |
| 2494 | -1.307 | 1.077 | -1.766 |
| 2495 | 0.972 | 1.091 | -1.789 |
| 2496 | 0.829 | 1.096 | -1.798 |
| 2497 | -0.066 | 1.094 | -1.794 |
| 2498 | -0.412 | 1.094 | -1.794 |
| 2499 | 0.49 | 1.094 | -1.795 |
| 2500 | -1.276 | 1.095 | -1.796 |
| 2501 | 0.912 | 1.108 | -1.817 |
| 2502 | 0.274 | 1.105 | -1.813 |
| 2503 | -1.244 | 1.099 | -1.803 |
| 2504 | 0.438 | 1.103 | -1.81 |
| 2505 | -0.931 | 1.077 | -1.767 |
| 2506 | -1.094 | 1.084 | -1.777 |
| 2507 | -0.303 | 1.072 | -1.758 |
| 2508 | -0.191 | 1.054 | -1.729 |
| 2509 | 0.669 | 1.055 | -1.729 |
| 2510 | -1.307 | 1.057 | -1.733 |
| 2511 | -1.416 | 1.069 | -1.754 |
| 2512 | 0.348 | 1.079 | -1.77 |
| 2513 | 0.303 | 1.07 | -1.755 |
| 2514 | 1.078 | 1.07 | -1.755 |
| 2515 | 0.074 | 1.064 | -1.744 |
| 2516 | -1.345 | 1.058 | -1.735 |
| 2517 | 0.798 | 1.058 | -1.735 |
| 2518 | 0.299 | 1.049 | -1.72 |
| 2519 | 0.052 | 1.048 | -1.719 |
| 2520 | 0.096 | 1.032 | -1.693 |
| 2521 | -0.197 | 1.027 | -1.684 |
| 2522 | 0.446 | 1.012 | -1.66 |
| 2523 | 0.209 | 0.982 | -1.61 |
| 2524 | 0.653 | 0.981 | -1.609 |
| 2525 | -1.463 | 0.977 | -1.602 |
| 2526 | 0.174 | 0.989 | -1.622 |
| 2527 | -1.46 | 0.98 | -1.607 |
| 2528 | -0.166 | 0.996 | -1.633 |
| 2529 | 1.96 | 0.989 | -1.622 |
| 2530 | -0.744 | 1.017 | -1.668 |
| 2531 | -1.221 | 1.019 | -1.67 |
| 2532 | 1.852 | 1.028 | -1.685 |
| 2533 | 2.42 | 1.051 | -1.724 |
| 2534 | 0.045 | 1.075 | -1.763 |
| 2535 | 0.58 | 1.063 | -1.743 |
| 2536 | -0.19 | 1.047 | -1.717 |
| 2537 | -0.137 | 1.044 | -1.713 |
| 2538 | -1.577 | 1.038 | -1.703 |
| 2539 | 0.601 | 1.047 | -1.717 |
| 2540 | 0.049 | 1.042 | -1.709 |
| 2541 | 1.592 | 1.016 | -1.666 |
| 2542 | 0.88 | 1.033 | -1.695 |
| 2543 | -0.072 | 1.031 | -1.692 |
| 2544 | -1.063 | 1.017 | -1.667 |
| 2545 | 0.442 | 0.993 | -1.628 |
| 2546 | -0.749 | 0.994 | -1.629 |
| 2547 | 1.791 | 0.985 | -1.615 |
| 2548 | 2.515 | 1.007 | -1.651 |
| 2549 | -0.704 | 1.045 | -1.714 |
| 2550 | -0.227 | 1.047 | -1.718 |
| 2551 | -0.307 | 1.036 | -1.7 |
| 2552 | 1.893 | 1.035 | -1.697 |
| 2553 | 0.087 | 1.03 | -1.689 |
| 2554 | -2.04 | 0.998 | -1.637 |
| 2555 | -1.478 | 1.026 | -1.683 |
| 2556 | 1.22 | 1.043 | -1.71 |
| 2557 | -0.035 | 1.028 | -1.686 |
| 2558 | -0.672 | 1.027 | -1.684 |
| 2559 | -1.674 | 1.03 | -1.69 |
| 2560 | -0.228 | 1.051 | -1.724 |
| 2561 | -0.037 | 1.039 | -1.704 |
| 2562 | 0.916 | 1.032 | -1.692 |
| 2563 | -0.812 | 1.033 | -1.694 |
| 2564 | 0.786 | 1.038 | -1.702 |
| 2565 | -0.099 | 1.041 | -1.708 |
| 2566 | -0.222 | 1.04 | -1.705 |
| 2567 | -0.515 | 1.028 | -1.685 |
| 2568 | -1.723 | 1.024 | -1.679 |
| 2569 | -0.119 | 1.044 | -1.713 |
| 2570 | -1.647 | 1.034 | -1.695 |
| 2571 | -0.258 | 1.051 | -1.724 |
| 2572 | 0.613 | 1.046 | -1.715 |
| 2573 | 1.797 | 1.04 | -1.706 |
| 2574 | 0.274 | 1.063 | -1.744 |
| 2575 | -0.443 | 1.063 | -1.744 |
| 2576 | -0.796 | 1.062 | -1.741 |
| 2577 | -0.117 | 1.054 | -1.728 |
| 2578 | 1.978 | 1.039 | -1.704 |
| 2579 | 0.436 | 1.065 | -1.747 |